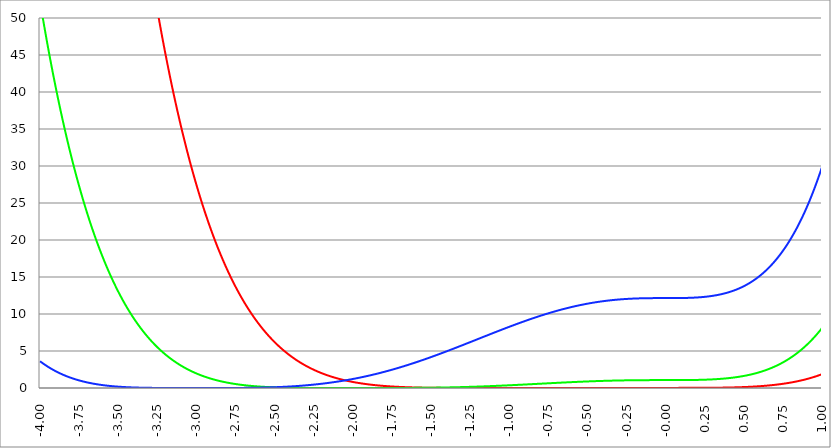
| Category | Series 1 | Series 0 | Series 2 |
|---|---|---|---|
| -4.0 | 238.95 | 52.267 | 3.617 |
| -3.9975 | 237.872 | 51.947 | 3.577 |
| -3.995 | 236.798 | 51.63 | 3.537 |
| -3.9925 | 235.728 | 51.314 | 3.498 |
| -3.99 | 234.662 | 50.999 | 3.459 |
| -3.9875 | 233.6 | 50.687 | 3.421 |
| -3.985 | 232.542 | 50.375 | 3.383 |
| -3.9825 | 231.489 | 50.066 | 3.345 |
| -3.98 | 230.439 | 49.757 | 3.308 |
| -3.9775 | 229.393 | 49.451 | 3.271 |
| -3.975000000000001 | 228.35 | 49.146 | 3.234 |
| -3.972500000000001 | 227.312 | 48.842 | 3.197 |
| -3.970000000000001 | 226.278 | 48.54 | 3.161 |
| -3.967500000000001 | 225.248 | 48.24 | 3.125 |
| -3.965000000000001 | 224.221 | 47.941 | 3.09 |
| -3.962500000000001 | 223.199 | 47.643 | 3.055 |
| -3.960000000000001 | 222.18 | 47.347 | 3.02 |
| -3.957500000000001 | 221.165 | 47.053 | 2.985 |
| -3.955000000000001 | 220.154 | 46.76 | 2.951 |
| -3.952500000000001 | 219.147 | 46.468 | 2.917 |
| -3.950000000000001 | 218.144 | 46.178 | 2.884 |
| -3.947500000000001 | 217.145 | 45.89 | 2.85 |
| -3.945000000000001 | 216.149 | 45.603 | 2.817 |
| -3.942500000000001 | 215.157 | 45.317 | 2.785 |
| -3.940000000000001 | 214.169 | 45.033 | 2.752 |
| -3.937500000000001 | 213.185 | 44.751 | 2.72 |
| -3.935000000000001 | 212.204 | 44.469 | 2.688 |
| -3.932500000000001 | 211.227 | 44.19 | 2.657 |
| -3.930000000000001 | 210.254 | 43.911 | 2.626 |
| -3.927500000000002 | 209.285 | 43.635 | 2.595 |
| -3.925000000000002 | 208.319 | 43.359 | 2.564 |
| -3.922500000000002 | 207.357 | 43.085 | 2.534 |
| -3.920000000000002 | 206.399 | 42.813 | 2.504 |
| -3.917500000000002 | 205.444 | 42.541 | 2.474 |
| -3.915000000000002 | 204.493 | 42.272 | 2.445 |
| -3.912500000000002 | 203.546 | 42.003 | 2.415 |
| -3.910000000000002 | 202.602 | 41.736 | 2.386 |
| -3.907500000000002 | 201.662 | 41.47 | 2.358 |
| -3.905000000000002 | 200.726 | 41.206 | 2.329 |
| -3.902500000000002 | 199.793 | 40.943 | 2.301 |
| -3.900000000000002 | 198.864 | 40.682 | 2.273 |
| -3.897500000000002 | 197.938 | 40.422 | 2.246 |
| -3.895000000000002 | 197.016 | 40.163 | 2.218 |
| -3.892500000000002 | 196.098 | 39.906 | 2.191 |
| -3.890000000000002 | 195.183 | 39.649 | 2.165 |
| -3.887500000000002 | 194.271 | 39.395 | 2.138 |
| -3.885000000000002 | 193.364 | 39.141 | 2.112 |
| -3.882500000000002 | 192.459 | 38.889 | 2.086 |
| -3.880000000000002 | 191.559 | 38.639 | 2.06 |
| -3.877500000000003 | 190.661 | 38.389 | 2.034 |
| -3.875000000000003 | 189.767 | 38.141 | 2.009 |
| -3.872500000000003 | 188.877 | 37.894 | 1.984 |
| -3.870000000000003 | 187.99 | 37.649 | 1.959 |
| -3.867500000000003 | 187.107 | 37.405 | 1.935 |
| -3.865000000000003 | 186.227 | 37.162 | 1.911 |
| -3.862500000000003 | 185.35 | 36.92 | 1.887 |
| -3.860000000000003 | 184.477 | 36.68 | 1.863 |
| -3.857500000000003 | 183.608 | 36.441 | 1.839 |
| -3.855000000000003 | 182.741 | 36.203 | 1.816 |
| -3.852500000000003 | 181.878 | 35.966 | 1.793 |
| -3.850000000000003 | 181.019 | 35.731 | 1.77 |
| -3.847500000000003 | 180.163 | 35.497 | 1.747 |
| -3.845000000000003 | 179.31 | 35.264 | 1.725 |
| -3.842500000000003 | 178.461 | 35.033 | 1.703 |
| -3.840000000000003 | 177.615 | 34.803 | 1.681 |
| -3.837500000000003 | 176.772 | 34.574 | 1.659 |
| -3.835000000000003 | 175.932 | 34.346 | 1.637 |
| -3.832500000000004 | 175.096 | 34.119 | 1.616 |
| -3.830000000000004 | 174.263 | 33.894 | 1.595 |
| -3.827500000000004 | 173.434 | 33.67 | 1.574 |
| -3.825000000000004 | 172.608 | 33.447 | 1.553 |
| -3.822500000000004 | 171.785 | 33.225 | 1.533 |
| -3.820000000000004 | 170.965 | 33.004 | 1.513 |
| -3.817500000000004 | 170.148 | 32.785 | 1.493 |
| -3.815000000000004 | 169.335 | 32.567 | 1.473 |
| -3.812500000000004 | 168.525 | 32.35 | 1.453 |
| -3.810000000000004 | 167.718 | 32.134 | 1.434 |
| -3.807500000000004 | 166.915 | 31.92 | 1.415 |
| -3.805000000000004 | 166.114 | 31.706 | 1.396 |
| -3.802500000000004 | 165.317 | 31.494 | 1.377 |
| -3.800000000000004 | 164.523 | 31.283 | 1.359 |
| -3.797500000000004 | 163.732 | 31.073 | 1.34 |
| -3.795000000000004 | 162.944 | 30.864 | 1.322 |
| -3.792500000000004 | 162.16 | 30.656 | 1.304 |
| -3.790000000000004 | 161.378 | 30.45 | 1.286 |
| -3.787500000000004 | 160.6 | 30.244 | 1.269 |
| -3.785000000000004 | 159.825 | 30.04 | 1.251 |
| -3.782500000000005 | 159.053 | 29.837 | 1.234 |
| -3.780000000000005 | 158.284 | 29.635 | 1.217 |
| -3.777500000000005 | 157.518 | 29.434 | 1.2 |
| -3.775000000000005 | 156.755 | 29.234 | 1.183 |
| -3.772500000000005 | 155.995 | 29.036 | 1.167 |
| -3.770000000000005 | 155.238 | 28.838 | 1.15 |
| -3.767500000000005 | 154.485 | 28.642 | 1.134 |
| -3.765000000000005 | 153.734 | 28.446 | 1.118 |
| -3.762500000000005 | 152.986 | 28.252 | 1.103 |
| -3.760000000000005 | 152.242 | 28.059 | 1.087 |
| -3.757500000000005 | 151.5 | 27.867 | 1.072 |
| -3.755000000000005 | 150.762 | 27.675 | 1.056 |
| -3.752500000000005 | 150.026 | 27.485 | 1.041 |
| -3.750000000000005 | 149.293 | 27.297 | 1.026 |
| -3.747500000000005 | 148.564 | 27.109 | 1.012 |
| -3.745000000000005 | 147.837 | 26.922 | 0.997 |
| -3.742500000000005 | 147.113 | 26.736 | 0.983 |
| -3.740000000000005 | 146.392 | 26.551 | 0.968 |
| -3.737500000000006 | 145.675 | 26.368 | 0.954 |
| -3.735000000000006 | 144.96 | 26.185 | 0.94 |
| -3.732500000000006 | 144.248 | 26.003 | 0.927 |
| -3.730000000000006 | 143.538 | 25.823 | 0.913 |
| -3.727500000000006 | 142.832 | 25.643 | 0.899 |
| -3.725000000000006 | 142.129 | 25.465 | 0.886 |
| -3.722500000000006 | 141.428 | 25.287 | 0.873 |
| -3.720000000000006 | 140.731 | 25.11 | 0.86 |
| -3.717500000000006 | 140.036 | 24.935 | 0.847 |
| -3.715000000000006 | 139.344 | 24.76 | 0.835 |
| -3.712500000000006 | 138.655 | 24.587 | 0.822 |
| -3.710000000000006 | 137.969 | 24.414 | 0.81 |
| -3.707500000000006 | 137.285 | 24.243 | 0.797 |
| -3.705000000000006 | 136.605 | 24.072 | 0.785 |
| -3.702500000000006 | 135.927 | 23.903 | 0.773 |
| -3.700000000000006 | 135.252 | 23.734 | 0.762 |
| -3.697500000000006 | 134.579 | 23.566 | 0.75 |
| -3.695000000000006 | 133.91 | 23.4 | 0.738 |
| -3.692500000000006 | 133.243 | 23.234 | 0.727 |
| -3.690000000000006 | 132.579 | 23.069 | 0.716 |
| -3.687500000000006 | 131.918 | 22.905 | 0.705 |
| -3.685000000000007 | 131.26 | 22.742 | 0.694 |
| -3.682500000000007 | 130.604 | 22.58 | 0.683 |
| -3.680000000000007 | 129.951 | 22.419 | 0.672 |
| -3.677500000000007 | 129.3 | 22.259 | 0.661 |
| -3.675000000000007 | 128.653 | 22.1 | 0.651 |
| -3.672500000000007 | 128.008 | 21.942 | 0.641 |
| -3.670000000000007 | 127.366 | 21.785 | 0.63 |
| -3.667500000000007 | 126.726 | 21.628 | 0.62 |
| -3.665000000000007 | 126.089 | 21.473 | 0.61 |
| -3.662500000000007 | 125.455 | 21.318 | 0.601 |
| -3.660000000000007 | 124.823 | 21.165 | 0.591 |
| -3.657500000000007 | 124.194 | 21.012 | 0.581 |
| -3.655000000000007 | 123.568 | 20.86 | 0.572 |
| -3.652500000000007 | 122.944 | 20.709 | 0.563 |
| -3.650000000000007 | 122.323 | 20.559 | 0.553 |
| -3.647500000000007 | 121.704 | 20.41 | 0.544 |
| -3.645000000000007 | 121.089 | 20.262 | 0.535 |
| -3.642500000000008 | 120.475 | 20.114 | 0.527 |
| -3.640000000000008 | 119.864 | 19.968 | 0.518 |
| -3.637500000000008 | 119.256 | 19.822 | 0.509 |
| -3.635000000000008 | 118.651 | 19.677 | 0.501 |
| -3.632500000000008 | 118.048 | 19.533 | 0.492 |
| -3.630000000000008 | 117.447 | 19.39 | 0.484 |
| -3.627500000000008 | 116.849 | 19.248 | 0.476 |
| -3.625000000000008 | 116.254 | 19.106 | 0.468 |
| -3.622500000000008 | 115.661 | 18.966 | 0.46 |
| -3.620000000000008 | 115.07 | 18.826 | 0.452 |
| -3.617500000000008 | 114.482 | 18.687 | 0.444 |
| -3.615000000000008 | 113.897 | 18.549 | 0.436 |
| -3.612500000000008 | 113.314 | 18.412 | 0.429 |
| -3.610000000000008 | 112.733 | 18.276 | 0.421 |
| -3.607500000000008 | 112.155 | 18.14 | 0.414 |
| -3.605000000000008 | 111.58 | 18.005 | 0.407 |
| -3.602500000000008 | 111.007 | 17.872 | 0.4 |
| -3.600000000000008 | 110.436 | 17.738 | 0.393 |
| -3.597500000000009 | 109.868 | 17.606 | 0.386 |
| -3.595000000000009 | 109.302 | 17.475 | 0.379 |
| -3.592500000000009 | 108.738 | 17.344 | 0.372 |
| -3.590000000000009 | 108.177 | 17.214 | 0.365 |
| -3.587500000000009 | 107.619 | 17.085 | 0.359 |
| -3.585000000000009 | 107.063 | 16.957 | 0.352 |
| -3.582500000000009 | 106.509 | 16.829 | 0.346 |
| -3.580000000000009 | 105.957 | 16.702 | 0.34 |
| -3.577500000000009 | 105.408 | 16.576 | 0.334 |
| -3.575000000000009 | 104.862 | 16.451 | 0.327 |
| -3.572500000000009 | 104.317 | 16.327 | 0.321 |
| -3.570000000000009 | 103.775 | 16.203 | 0.315 |
| -3.56750000000001 | 103.235 | 16.08 | 0.31 |
| -3.565000000000009 | 102.698 | 15.958 | 0.304 |
| -3.562500000000009 | 102.163 | 15.836 | 0.298 |
| -3.560000000000009 | 101.63 | 15.716 | 0.293 |
| -3.557500000000009 | 101.1 | 15.596 | 0.287 |
| -3.555000000000009 | 100.572 | 15.477 | 0.282 |
| -3.55250000000001 | 100.046 | 15.358 | 0.276 |
| -3.55000000000001 | 99.522 | 15.241 | 0.271 |
| -3.54750000000001 | 99.001 | 15.124 | 0.266 |
| -3.54500000000001 | 98.482 | 15.007 | 0.261 |
| -3.54250000000001 | 97.965 | 14.892 | 0.256 |
| -3.54000000000001 | 97.451 | 14.777 | 0.251 |
| -3.53750000000001 | 96.939 | 14.663 | 0.246 |
| -3.53500000000001 | 96.429 | 14.55 | 0.241 |
| -3.53250000000001 | 95.921 | 14.437 | 0.236 |
| -3.53000000000001 | 95.415 | 14.325 | 0.231 |
| -3.52750000000001 | 94.912 | 14.214 | 0.227 |
| -3.52500000000001 | 94.411 | 14.103 | 0.222 |
| -3.52250000000001 | 93.912 | 13.993 | 0.218 |
| -3.52000000000001 | 93.415 | 13.884 | 0.213 |
| -3.51750000000001 | 92.92 | 13.776 | 0.209 |
| -3.51500000000001 | 92.428 | 13.668 | 0.205 |
| -3.51250000000001 | 91.937 | 13.561 | 0.201 |
| -3.51000000000001 | 91.449 | 13.455 | 0.197 |
| -3.50750000000001 | 90.963 | 13.349 | 0.192 |
| -3.505000000000011 | 90.48 | 13.244 | 0.189 |
| -3.502500000000011 | 89.998 | 13.14 | 0.185 |
| -3.500000000000011 | 89.518 | 13.036 | 0.181 |
| -3.497500000000011 | 89.041 | 12.933 | 0.177 |
| -3.495000000000011 | 88.565 | 12.831 | 0.173 |
| -3.492500000000011 | 88.092 | 12.729 | 0.17 |
| -3.490000000000011 | 87.621 | 12.628 | 0.166 |
| -3.487500000000011 | 87.152 | 12.527 | 0.162 |
| -3.485000000000011 | 86.685 | 12.428 | 0.159 |
| -3.482500000000011 | 86.22 | 12.329 | 0.155 |
| -3.480000000000011 | 85.757 | 12.23 | 0.152 |
| -3.477500000000011 | 85.297 | 12.132 | 0.149 |
| -3.475000000000011 | 84.838 | 12.035 | 0.145 |
| -3.472500000000011 | 84.381 | 11.938 | 0.142 |
| -3.470000000000011 | 83.926 | 11.843 | 0.139 |
| -3.467500000000011 | 83.474 | 11.747 | 0.136 |
| -3.465000000000011 | 83.023 | 11.653 | 0.133 |
| -3.462500000000011 | 82.575 | 11.558 | 0.13 |
| -3.460000000000011 | 82.128 | 11.465 | 0.127 |
| -3.457500000000012 | 81.684 | 11.372 | 0.124 |
| -3.455000000000012 | 81.241 | 11.28 | 0.121 |
| -3.452500000000012 | 80.801 | 11.188 | 0.119 |
| -3.450000000000012 | 80.362 | 11.097 | 0.116 |
| -3.447500000000012 | 79.925 | 11.007 | 0.113 |
| -3.445000000000012 | 79.491 | 10.917 | 0.11 |
| -3.442500000000012 | 79.058 | 10.828 | 0.108 |
| -3.440000000000012 | 78.627 | 10.739 | 0.105 |
| -3.437500000000012 | 78.198 | 10.651 | 0.103 |
| -3.435000000000012 | 77.772 | 10.564 | 0.1 |
| -3.432500000000012 | 77.347 | 10.477 | 0.098 |
| -3.430000000000012 | 76.924 | 10.391 | 0.096 |
| -3.427500000000012 | 76.503 | 10.305 | 0.093 |
| -3.425000000000012 | 76.083 | 10.22 | 0.091 |
| -3.422500000000012 | 75.666 | 10.135 | 0.089 |
| -3.420000000000012 | 75.251 | 10.051 | 0.087 |
| -3.417500000000012 | 74.837 | 9.968 | 0.084 |
| -3.415000000000012 | 74.426 | 9.885 | 0.082 |
| -3.412500000000012 | 74.016 | 9.802 | 0.08 |
| -3.410000000000013 | 73.608 | 9.721 | 0.078 |
| -3.407500000000012 | 73.202 | 9.639 | 0.076 |
| -3.405000000000013 | 72.798 | 9.559 | 0.074 |
| -3.402500000000013 | 72.396 | 9.479 | 0.072 |
| -3.400000000000013 | 71.995 | 9.399 | 0.071 |
| -3.397500000000013 | 71.597 | 9.32 | 0.069 |
| -3.395000000000013 | 71.2 | 9.242 | 0.067 |
| -3.392500000000013 | 70.805 | 9.164 | 0.065 |
| -3.390000000000013 | 70.412 | 9.086 | 0.063 |
| -3.387500000000013 | 70.021 | 9.009 | 0.062 |
| -3.385000000000013 | 69.631 | 8.933 | 0.06 |
| -3.382500000000013 | 69.243 | 8.857 | 0.059 |
| -3.380000000000013 | 68.857 | 8.782 | 0.057 |
| -3.377500000000013 | 68.473 | 8.707 | 0.055 |
| -3.375000000000013 | 68.091 | 8.633 | 0.054 |
| -3.372500000000013 | 67.71 | 8.559 | 0.052 |
| -3.370000000000013 | 67.332 | 8.486 | 0.051 |
| -3.367500000000013 | 66.954 | 8.413 | 0.049 |
| -3.365000000000013 | 66.579 | 8.341 | 0.048 |
| -3.362500000000014 | 66.206 | 8.269 | 0.047 |
| -3.360000000000014 | 65.834 | 8.198 | 0.045 |
| -3.357500000000014 | 65.464 | 8.127 | 0.044 |
| -3.355000000000014 | 65.095 | 8.057 | 0.043 |
| -3.352500000000014 | 64.728 | 7.987 | 0.042 |
| -3.350000000000014 | 64.364 | 7.918 | 0.04 |
| -3.347500000000014 | 64 | 7.849 | 0.039 |
| -3.345000000000014 | 63.639 | 7.781 | 0.038 |
| -3.342500000000014 | 63.279 | 7.713 | 0.037 |
| -3.340000000000014 | 62.921 | 7.645 | 0.036 |
| -3.337500000000014 | 62.564 | 7.579 | 0.035 |
| -3.335000000000014 | 62.209 | 7.512 | 0.034 |
| -3.332500000000014 | 61.856 | 7.446 | 0.033 |
| -3.330000000000014 | 61.505 | 7.381 | 0.032 |
| -3.327500000000014 | 61.155 | 7.316 | 0.031 |
| -3.325000000000014 | 60.807 | 7.251 | 0.03 |
| -3.322500000000014 | 60.46 | 7.187 | 0.029 |
| -3.320000000000014 | 60.115 | 7.124 | 0.028 |
| -3.317500000000015 | 59.772 | 7.06 | 0.027 |
| -3.315000000000015 | 59.43 | 6.998 | 0.026 |
| -3.312500000000015 | 59.09 | 6.935 | 0.025 |
| -3.310000000000015 | 58.752 | 6.874 | 0.024 |
| -3.307500000000015 | 58.415 | 6.812 | 0.024 |
| -3.305000000000015 | 58.08 | 6.751 | 0.023 |
| -3.302500000000015 | 57.746 | 6.691 | 0.022 |
| -3.300000000000015 | 57.414 | 6.631 | 0.021 |
| -3.297500000000015 | 57.084 | 6.571 | 0.021 |
| -3.295000000000015 | 56.755 | 6.512 | 0.02 |
| -3.292500000000015 | 56.427 | 6.453 | 0.019 |
| -3.290000000000015 | 56.102 | 6.395 | 0.018 |
| -3.287500000000015 | 55.777 | 6.337 | 0.018 |
| -3.285000000000015 | 55.455 | 6.28 | 0.017 |
| -3.282500000000015 | 55.134 | 6.223 | 0.017 |
| -3.280000000000015 | 54.814 | 6.166 | 0.016 |
| -3.277500000000015 | 54.496 | 6.11 | 0.015 |
| -3.275000000000015 | 54.18 | 6.054 | 0.015 |
| -3.272500000000015 | 53.865 | 5.999 | 0.014 |
| -3.270000000000016 | 53.551 | 5.944 | 0.014 |
| -3.267500000000015 | 53.239 | 5.889 | 0.013 |
| -3.265000000000016 | 52.929 | 5.835 | 0.013 |
| -3.262500000000016 | 52.62 | 5.781 | 0.012 |
| -3.260000000000016 | 52.313 | 5.728 | 0.012 |
| -3.257500000000016 | 52.007 | 5.675 | 0.011 |
| -3.255000000000016 | 51.702 | 5.623 | 0.011 |
| -3.252500000000016 | 51.399 | 5.57 | 0.01 |
| -3.250000000000016 | 51.098 | 5.519 | 0.01 |
| -3.247500000000016 | 50.798 | 5.467 | 0.01 |
| -3.245000000000016 | 50.499 | 5.416 | 0.009 |
| -3.242500000000016 | 50.202 | 5.366 | 0.009 |
| -3.240000000000016 | 49.906 | 5.315 | 0.008 |
| -3.237500000000016 | 49.612 | 5.266 | 0.008 |
| -3.235000000000016 | 49.319 | 5.216 | 0.008 |
| -3.232500000000016 | 49.028 | 5.167 | 0.007 |
| -3.230000000000016 | 48.738 | 5.118 | 0.007 |
| -3.227500000000016 | 48.449 | 5.07 | 0.007 |
| -3.225000000000016 | 48.162 | 5.022 | 0.006 |
| -3.222500000000016 | 47.876 | 4.974 | 0.006 |
| -3.220000000000016 | 47.592 | 4.927 | 0.006 |
| -3.217500000000016 | 47.309 | 4.88 | 0.006 |
| -3.215000000000017 | 47.028 | 4.834 | 0.005 |
| -3.212500000000017 | 46.748 | 4.787 | 0.005 |
| -3.210000000000017 | 46.469 | 4.742 | 0.005 |
| -3.207500000000016 | 46.191 | 4.696 | 0.005 |
| -3.205000000000017 | 45.915 | 4.651 | 0.004 |
| -3.202500000000017 | 45.641 | 4.606 | 0.004 |
| -3.200000000000017 | 45.368 | 4.562 | 0.004 |
| -3.197500000000017 | 45.096 | 4.518 | 0.004 |
| -3.195000000000017 | 44.825 | 4.474 | 0.004 |
| -3.192500000000017 | 44.556 | 4.431 | 0.003 |
| -3.190000000000017 | 44.288 | 4.388 | 0.003 |
| -3.187500000000017 | 44.021 | 4.345 | 0.003 |
| -3.185000000000017 | 43.756 | 4.303 | 0.003 |
| -3.182500000000017 | 43.492 | 4.261 | 0.003 |
| -3.180000000000017 | 43.23 | 4.219 | 0.003 |
| -3.177500000000017 | 42.969 | 4.178 | 0.002 |
| -3.175000000000018 | 42.709 | 4.136 | 0.002 |
| -3.172500000000018 | 42.45 | 4.096 | 0.002 |
| -3.170000000000018 | 42.193 | 4.055 | 0.002 |
| -3.167500000000017 | 41.936 | 4.015 | 0.002 |
| -3.165000000000018 | 41.682 | 3.976 | 0.002 |
| -3.162500000000018 | 41.428 | 3.936 | 0.002 |
| -3.160000000000018 | 41.176 | 3.897 | 0.002 |
| -3.157500000000018 | 40.925 | 3.858 | 0.002 |
| -3.155000000000018 | 40.675 | 3.82 | 0.001 |
| -3.152500000000018 | 40.427 | 3.781 | 0.001 |
| -3.150000000000018 | 40.18 | 3.744 | 0.001 |
| -3.147500000000018 | 39.934 | 3.706 | 0.001 |
| -3.145000000000018 | 39.689 | 3.669 | 0.001 |
| -3.142500000000018 | 39.446 | 3.632 | 0.001 |
| -3.140000000000018 | 39.204 | 3.595 | 0.001 |
| -3.137500000000018 | 38.963 | 3.559 | 0.001 |
| -3.135000000000018 | 38.723 | 3.523 | 0.001 |
| -3.132500000000018 | 38.484 | 3.487 | 0.001 |
| -3.130000000000019 | 38.247 | 3.451 | 0.001 |
| -3.127500000000018 | 38.011 | 3.416 | 0.001 |
| -3.125000000000019 | 37.776 | 3.381 | 0.001 |
| -3.122500000000019 | 37.543 | 3.347 | 0.001 |
| -3.120000000000019 | 37.31 | 3.312 | 0 |
| -3.117500000000019 | 37.079 | 3.278 | 0 |
| -3.115000000000019 | 36.849 | 3.245 | 0 |
| -3.112500000000019 | 36.62 | 3.211 | 0 |
| -3.110000000000019 | 36.392 | 3.178 | 0 |
| -3.10750000000002 | 36.165 | 3.145 | 0 |
| -3.10500000000002 | 35.94 | 3.112 | 0 |
| -3.10250000000002 | 35.716 | 3.08 | 0 |
| -3.10000000000002 | 35.493 | 3.048 | 0 |
| -3.09750000000002 | 35.271 | 3.016 | 0 |
| -3.095000000000019 | 35.05 | 2.984 | 0 |
| -3.092500000000019 | 34.83 | 2.953 | 0 |
| -3.090000000000019 | 34.612 | 2.922 | 0 |
| -3.08750000000002 | 34.395 | 2.891 | 0 |
| -3.085000000000019 | 34.178 | 2.861 | 0 |
| -3.08250000000002 | 33.963 | 2.83 | 0 |
| -3.08000000000002 | 33.749 | 2.8 | 0 |
| -3.07750000000002 | 33.536 | 2.771 | 0 |
| -3.07500000000002 | 33.325 | 2.741 | 0 |
| -3.07250000000002 | 33.114 | 2.712 | 0 |
| -3.07000000000002 | 32.905 | 2.683 | 0 |
| -3.06750000000002 | 32.696 | 2.654 | 0 |
| -3.06500000000002 | 32.489 | 2.626 | 0 |
| -3.06250000000002 | 32.282 | 2.597 | 0 |
| -3.06000000000002 | 32.077 | 2.569 | 0 |
| -3.05750000000002 | 31.873 | 2.542 | 0 |
| -3.05500000000002 | 31.67 | 2.514 | 0 |
| -3.05250000000002 | 31.468 | 2.487 | 0 |
| -3.05000000000002 | 31.267 | 2.46 | 0 |
| -3.04750000000002 | 31.068 | 2.433 | 0 |
| -3.04500000000002 | 30.869 | 2.407 | 0 |
| -3.04250000000002 | 30.671 | 2.38 | 0 |
| -3.04000000000002 | 30.474 | 2.354 | 0 |
| -3.037500000000021 | 30.279 | 2.328 | 0 |
| -3.035000000000021 | 30.084 | 2.303 | 0 |
| -3.032500000000021 | 29.891 | 2.277 | 0 |
| -3.030000000000021 | 29.698 | 2.252 | 0 |
| -3.027500000000021 | 29.507 | 2.227 | 0 |
| -3.025000000000021 | 29.316 | 2.202 | 0 |
| -3.022500000000021 | 29.127 | 2.178 | 0 |
| -3.020000000000021 | 28.938 | 2.153 | 0 |
| -3.017500000000021 | 28.751 | 2.129 | 0 |
| -3.015000000000021 | 28.564 | 2.105 | 0 |
| -3.012500000000021 | 28.379 | 2.082 | 0 |
| -3.010000000000021 | 28.195 | 2.058 | 0 |
| -3.007500000000021 | 28.011 | 2.035 | 0 |
| -3.005000000000021 | 27.829 | 2.012 | 0 |
| -3.002500000000021 | 27.647 | 1.989 | 0 |
| -3.000000000000021 | 27.467 | 1.967 | 0 |
| -2.997500000000021 | 27.287 | 1.944 | 0 |
| -2.995000000000021 | 27.109 | 1.922 | 0 |
| -2.992500000000021 | 26.931 | 1.9 | 0 |
| -2.990000000000021 | 26.754 | 1.878 | 0 |
| -2.987500000000022 | 26.579 | 1.857 | 0 |
| -2.985000000000022 | 26.404 | 1.835 | 0 |
| -2.982500000000022 | 26.23 | 1.814 | 0 |
| -2.980000000000022 | 26.058 | 1.793 | 0 |
| -2.977500000000022 | 25.886 | 1.772 | 0 |
| -2.975000000000022 | 25.715 | 1.752 | 0 |
| -2.972500000000022 | 25.545 | 1.731 | 0 |
| -2.970000000000022 | 25.376 | 1.711 | 0 |
| -2.967500000000022 | 25.208 | 1.691 | 0 |
| -2.965000000000022 | 25.04 | 1.671 | 0 |
| -2.962500000000022 | 24.874 | 1.652 | 0 |
| -2.960000000000022 | 24.709 | 1.632 | 0 |
| -2.957500000000022 | 24.544 | 1.613 | 0 |
| -2.955000000000022 | 24.381 | 1.594 | 0 |
| -2.952500000000022 | 24.218 | 1.575 | 0 |
| -2.950000000000022 | 24.056 | 1.556 | 0 |
| -2.947500000000022 | 23.895 | 1.537 | 0 |
| -2.945000000000022 | 23.735 | 1.519 | 0 |
| -2.942500000000023 | 23.576 | 1.501 | 0 |
| -2.940000000000023 | 23.418 | 1.483 | 0 |
| -2.937500000000023 | 23.261 | 1.465 | 0 |
| -2.935000000000023 | 23.104 | 1.447 | 0 |
| -2.932500000000023 | 22.949 | 1.43 | 0 |
| -2.930000000000023 | 22.794 | 1.412 | 0 |
| -2.927500000000023 | 22.64 | 1.395 | 0 |
| -2.925000000000023 | 22.487 | 1.378 | 0 |
| -2.922500000000023 | 22.335 | 1.361 | 0 |
| -2.920000000000023 | 22.184 | 1.345 | 0 |
| -2.917500000000023 | 22.033 | 1.328 | 0 |
| -2.915000000000023 | 21.884 | 1.312 | 0 |
| -2.912500000000023 | 21.735 | 1.296 | 0 |
| -2.910000000000023 | 21.587 | 1.28 | 0 |
| -2.907500000000023 | 21.44 | 1.264 | 0 |
| -2.905000000000023 | 21.293 | 1.248 | 0 |
| -2.902500000000023 | 21.148 | 1.232 | 0 |
| -2.900000000000023 | 21.003 | 1.217 | 0 |
| -2.897500000000023 | 20.86 | 1.202 | 0 |
| -2.895000000000023 | 20.717 | 1.187 | 0 |
| -2.892500000000024 | 20.574 | 1.172 | 0 |
| -2.890000000000024 | 20.433 | 1.157 | 0 |
| -2.887500000000024 | 20.292 | 1.142 | 0 |
| -2.885000000000024 | 20.153 | 1.128 | 0 |
| -2.882500000000024 | 20.014 | 1.113 | 0 |
| -2.880000000000024 | 19.876 | 1.099 | 0 |
| -2.877500000000024 | 19.738 | 1.085 | 0 |
| -2.875000000000024 | 19.602 | 1.071 | 0.001 |
| -2.872500000000024 | 19.466 | 1.058 | 0.001 |
| -2.870000000000024 | 19.331 | 1.044 | 0.001 |
| -2.867500000000024 | 19.196 | 1.03 | 0.001 |
| -2.865000000000024 | 19.063 | 1.017 | 0.001 |
| -2.862500000000024 | 18.93 | 1.004 | 0.001 |
| -2.860000000000024 | 18.798 | 0.991 | 0.001 |
| -2.857500000000024 | 18.667 | 0.978 | 0.001 |
| -2.855000000000024 | 18.537 | 0.965 | 0.001 |
| -2.852500000000024 | 18.407 | 0.952 | 0.001 |
| -2.850000000000024 | 18.278 | 0.94 | 0.001 |
| -2.847500000000025 | 18.15 | 0.927 | 0.001 |
| -2.845000000000025 | 18.022 | 0.915 | 0.001 |
| -2.842500000000025 | 17.896 | 0.903 | 0.001 |
| -2.840000000000025 | 17.77 | 0.891 | 0.001 |
| -2.837500000000025 | 17.644 | 0.879 | 0.001 |
| -2.835000000000025 | 17.52 | 0.867 | 0.002 |
| -2.832500000000025 | 17.396 | 0.856 | 0.002 |
| -2.830000000000025 | 17.273 | 0.844 | 0.002 |
| -2.827500000000025 | 17.151 | 0.833 | 0.002 |
| -2.825000000000025 | 17.029 | 0.822 | 0.002 |
| -2.822500000000025 | 16.908 | 0.81 | 0.002 |
| -2.820000000000025 | 16.788 | 0.799 | 0.002 |
| -2.817500000000025 | 16.668 | 0.788 | 0.002 |
| -2.815000000000025 | 16.55 | 0.778 | 0.002 |
| -2.812500000000025 | 16.431 | 0.767 | 0.003 |
| -2.810000000000025 | 16.314 | 0.756 | 0.003 |
| -2.807500000000025 | 16.197 | 0.746 | 0.003 |
| -2.805000000000025 | 16.081 | 0.736 | 0.003 |
| -2.802500000000025 | 15.966 | 0.726 | 0.003 |
| -2.800000000000026 | 15.851 | 0.715 | 0.003 |
| -2.797500000000026 | 15.737 | 0.705 | 0.003 |
| -2.795000000000026 | 15.624 | 0.696 | 0.004 |
| -2.792500000000026 | 15.512 | 0.686 | 0.004 |
| -2.790000000000026 | 15.4 | 0.676 | 0.004 |
| -2.787500000000026 | 15.288 | 0.667 | 0.004 |
| -2.785000000000026 | 15.178 | 0.657 | 0.004 |
| -2.782500000000026 | 15.068 | 0.648 | 0.004 |
| -2.780000000000026 | 14.958 | 0.639 | 0.005 |
| -2.777500000000026 | 14.85 | 0.63 | 0.005 |
| -2.775000000000026 | 14.742 | 0.621 | 0.005 |
| -2.772500000000026 | 14.634 | 0.612 | 0.005 |
| -2.770000000000026 | 14.528 | 0.603 | 0.006 |
| -2.767500000000026 | 14.422 | 0.594 | 0.006 |
| -2.765000000000026 | 14.316 | 0.585 | 0.006 |
| -2.762500000000026 | 14.212 | 0.577 | 0.006 |
| -2.760000000000026 | 14.107 | 0.569 | 0.007 |
| -2.757500000000026 | 14.004 | 0.56 | 0.007 |
| -2.755000000000026 | 13.901 | 0.552 | 0.007 |
| -2.752500000000027 | 13.799 | 0.544 | 0.007 |
| -2.750000000000027 | 13.697 | 0.536 | 0.008 |
| -2.747500000000026 | 13.596 | 0.528 | 0.008 |
| -2.745000000000027 | 13.496 | 0.52 | 0.008 |
| -2.742500000000027 | 13.396 | 0.512 | 0.009 |
| -2.740000000000027 | 13.297 | 0.505 | 0.009 |
| -2.737500000000027 | 13.198 | 0.497 | 0.009 |
| -2.735000000000027 | 13.1 | 0.49 | 0.01 |
| -2.732500000000027 | 13.003 | 0.482 | 0.01 |
| -2.730000000000027 | 12.906 | 0.475 | 0.01 |
| -2.727500000000027 | 12.81 | 0.468 | 0.011 |
| -2.725000000000027 | 12.714 | 0.461 | 0.011 |
| -2.722500000000027 | 12.619 | 0.454 | 0.011 |
| -2.720000000000027 | 12.525 | 0.447 | 0.012 |
| -2.717500000000027 | 12.431 | 0.44 | 0.012 |
| -2.715000000000027 | 12.338 | 0.433 | 0.013 |
| -2.712500000000027 | 12.245 | 0.426 | 0.013 |
| -2.710000000000027 | 12.153 | 0.42 | 0.014 |
| -2.707500000000027 | 12.062 | 0.413 | 0.014 |
| -2.705000000000028 | 11.971 | 0.407 | 0.014 |
| -2.702500000000028 | 11.88 | 0.4 | 0.015 |
| -2.700000000000028 | 11.79 | 0.394 | 0.015 |
| -2.697500000000028 | 11.701 | 0.388 | 0.016 |
| -2.695000000000028 | 11.612 | 0.382 | 0.016 |
| -2.692500000000028 | 11.524 | 0.376 | 0.017 |
| -2.690000000000028 | 11.437 | 0.37 | 0.017 |
| -2.687500000000028 | 11.35 | 0.364 | 0.018 |
| -2.685000000000028 | 11.263 | 0.358 | 0.019 |
| -2.682500000000028 | 11.177 | 0.352 | 0.019 |
| -2.680000000000028 | 11.092 | 0.347 | 0.02 |
| -2.677500000000028 | 11.007 | 0.341 | 0.02 |
| -2.675000000000028 | 10.923 | 0.335 | 0.021 |
| -2.672500000000028 | 10.839 | 0.33 | 0.022 |
| -2.670000000000028 | 10.755 | 0.325 | 0.022 |
| -2.667500000000028 | 10.673 | 0.319 | 0.023 |
| -2.665000000000028 | 10.591 | 0.314 | 0.024 |
| -2.662500000000028 | 10.509 | 0.309 | 0.024 |
| -2.660000000000028 | 10.428 | 0.304 | 0.025 |
| -2.657500000000029 | 10.347 | 0.299 | 0.026 |
| -2.655000000000029 | 10.267 | 0.294 | 0.026 |
| -2.652500000000029 | 10.187 | 0.289 | 0.027 |
| -2.650000000000029 | 10.108 | 0.284 | 0.028 |
| -2.647500000000029 | 10.03 | 0.279 | 0.029 |
| -2.645000000000029 | 9.951 | 0.274 | 0.029 |
| -2.642500000000029 | 9.874 | 0.27 | 0.03 |
| -2.640000000000029 | 9.797 | 0.265 | 0.031 |
| -2.637500000000029 | 9.72 | 0.261 | 0.032 |
| -2.635000000000029 | 9.644 | 0.256 | 0.033 |
| -2.632500000000029 | 9.568 | 0.252 | 0.033 |
| -2.630000000000029 | 9.493 | 0.247 | 0.034 |
| -2.62750000000003 | 9.419 | 0.243 | 0.035 |
| -2.625000000000029 | 9.344 | 0.239 | 0.036 |
| -2.622500000000029 | 9.271 | 0.235 | 0.037 |
| -2.620000000000029 | 9.198 | 0.231 | 0.038 |
| -2.617500000000029 | 9.125 | 0.226 | 0.039 |
| -2.615000000000029 | 9.053 | 0.222 | 0.04 |
| -2.612500000000029 | 8.981 | 0.219 | 0.041 |
| -2.61000000000003 | 8.909 | 0.215 | 0.042 |
| -2.60750000000003 | 8.839 | 0.211 | 0.043 |
| -2.60500000000003 | 8.768 | 0.207 | 0.044 |
| -2.60250000000003 | 8.698 | 0.203 | 0.045 |
| -2.60000000000003 | 8.629 | 0.2 | 0.046 |
| -2.59750000000003 | 8.56 | 0.196 | 0.047 |
| -2.59500000000003 | 8.491 | 0.192 | 0.048 |
| -2.59250000000003 | 8.423 | 0.189 | 0.049 |
| -2.59000000000003 | 8.356 | 0.185 | 0.05 |
| -2.58750000000003 | 8.288 | 0.182 | 0.052 |
| -2.58500000000003 | 8.222 | 0.179 | 0.053 |
| -2.58250000000003 | 8.155 | 0.175 | 0.054 |
| -2.58000000000003 | 8.09 | 0.172 | 0.055 |
| -2.57750000000003 | 8.024 | 0.169 | 0.056 |
| -2.57500000000003 | 7.959 | 0.166 | 0.058 |
| -2.57250000000003 | 7.895 | 0.162 | 0.059 |
| -2.57000000000003 | 7.831 | 0.159 | 0.06 |
| -2.56750000000003 | 7.767 | 0.156 | 0.062 |
| -2.565000000000031 | 7.704 | 0.153 | 0.063 |
| -2.562500000000031 | 7.641 | 0.15 | 0.064 |
| -2.560000000000031 | 7.578 | 0.148 | 0.066 |
| -2.557500000000031 | 7.516 | 0.145 | 0.067 |
| -2.555000000000031 | 7.455 | 0.142 | 0.069 |
| -2.552500000000031 | 7.394 | 0.139 | 0.07 |
| -2.550000000000031 | 7.333 | 0.136 | 0.072 |
| -2.547500000000031 | 7.273 | 0.134 | 0.073 |
| -2.545000000000031 | 7.213 | 0.131 | 0.075 |
| -2.542500000000031 | 7.153 | 0.128 | 0.076 |
| -2.540000000000031 | 7.094 | 0.126 | 0.078 |
| -2.537500000000031 | 7.035 | 0.123 | 0.079 |
| -2.535000000000031 | 6.977 | 0.121 | 0.081 |
| -2.532500000000031 | 6.919 | 0.118 | 0.082 |
| -2.530000000000031 | 6.862 | 0.116 | 0.084 |
| -2.527500000000031 | 6.804 | 0.114 | 0.086 |
| -2.525000000000031 | 6.748 | 0.111 | 0.087 |
| -2.522500000000031 | 6.691 | 0.109 | 0.089 |
| -2.520000000000032 | 6.635 | 0.107 | 0.091 |
| -2.517500000000032 | 6.58 | 0.105 | 0.093 |
| -2.515000000000032 | 6.525 | 0.102 | 0.094 |
| -2.512500000000032 | 6.47 | 0.1 | 0.096 |
| -2.510000000000032 | 6.415 | 0.098 | 0.098 |
| -2.507500000000032 | 6.361 | 0.096 | 0.1 |
| -2.505000000000032 | 6.308 | 0.094 | 0.102 |
| -2.502500000000032 | 6.254 | 0.092 | 0.104 |
| -2.500000000000032 | 6.202 | 0.09 | 0.106 |
| -2.497500000000032 | 6.149 | 0.088 | 0.108 |
| -2.495000000000032 | 6.097 | 0.086 | 0.11 |
| -2.492500000000032 | 6.045 | 0.084 | 0.112 |
| -2.490000000000032 | 5.994 | 0.083 | 0.114 |
| -2.487500000000032 | 5.942 | 0.081 | 0.116 |
| -2.485000000000032 | 5.892 | 0.079 | 0.118 |
| -2.482500000000032 | 5.841 | 0.077 | 0.12 |
| -2.480000000000032 | 5.791 | 0.076 | 0.122 |
| -2.477500000000032 | 5.742 | 0.074 | 0.124 |
| -2.475000000000032 | 5.692 | 0.072 | 0.127 |
| -2.472500000000033 | 5.643 | 0.071 | 0.129 |
| -2.470000000000033 | 5.595 | 0.069 | 0.131 |
| -2.467500000000032 | 5.546 | 0.067 | 0.133 |
| -2.465000000000033 | 5.499 | 0.066 | 0.136 |
| -2.462500000000033 | 5.451 | 0.064 | 0.138 |
| -2.460000000000033 | 5.404 | 0.063 | 0.14 |
| -2.457500000000033 | 5.357 | 0.061 | 0.143 |
| -2.455000000000033 | 5.31 | 0.06 | 0.145 |
| -2.452500000000033 | 5.264 | 0.059 | 0.148 |
| -2.450000000000033 | 5.218 | 0.057 | 0.15 |
| -2.447500000000033 | 5.172 | 0.056 | 0.153 |
| -2.445000000000033 | 5.127 | 0.054 | 0.155 |
| -2.442500000000033 | 5.082 | 0.053 | 0.158 |
| -2.440000000000033 | 5.038 | 0.052 | 0.16 |
| -2.437500000000033 | 4.993 | 0.051 | 0.163 |
| -2.435000000000033 | 4.949 | 0.049 | 0.166 |
| -2.432500000000033 | 4.906 | 0.048 | 0.168 |
| -2.430000000000033 | 4.862 | 0.047 | 0.171 |
| -2.427500000000033 | 4.819 | 0.046 | 0.174 |
| -2.425000000000034 | 4.777 | 0.045 | 0.177 |
| -2.422500000000034 | 4.734 | 0.044 | 0.179 |
| -2.420000000000034 | 4.692 | 0.042 | 0.182 |
| -2.417500000000034 | 4.651 | 0.041 | 0.185 |
| -2.415000000000034 | 4.609 | 0.04 | 0.188 |
| -2.412500000000034 | 4.568 | 0.039 | 0.191 |
| -2.410000000000034 | 4.527 | 0.038 | 0.194 |
| -2.407500000000034 | 4.486 | 0.037 | 0.197 |
| -2.405000000000034 | 4.446 | 0.036 | 0.2 |
| -2.402500000000034 | 4.406 | 0.035 | 0.203 |
| -2.400000000000034 | 4.367 | 0.034 | 0.206 |
| -2.397500000000034 | 4.327 | 0.034 | 0.209 |
| -2.395000000000034 | 4.288 | 0.033 | 0.212 |
| -2.392500000000034 | 4.249 | 0.032 | 0.216 |
| -2.390000000000034 | 4.211 | 0.031 | 0.219 |
| -2.387500000000034 | 4.173 | 0.03 | 0.222 |
| -2.385000000000034 | 4.135 | 0.029 | 0.225 |
| -2.382500000000034 | 4.097 | 0.028 | 0.229 |
| -2.380000000000034 | 4.06 | 0.028 | 0.232 |
| -2.377500000000035 | 4.023 | 0.027 | 0.235 |
| -2.375000000000035 | 3.986 | 0.026 | 0.239 |
| -2.372500000000035 | 3.949 | 0.025 | 0.242 |
| -2.370000000000035 | 3.913 | 0.025 | 0.246 |
| -2.367500000000035 | 3.877 | 0.024 | 0.249 |
| -2.365000000000035 | 3.841 | 0.023 | 0.253 |
| -2.362500000000035 | 3.806 | 0.023 | 0.256 |
| -2.360000000000035 | 3.771 | 0.022 | 0.26 |
| -2.357500000000035 | 3.736 | 0.021 | 0.264 |
| -2.355000000000035 | 3.701 | 0.021 | 0.267 |
| -2.352500000000035 | 3.667 | 0.02 | 0.271 |
| -2.350000000000035 | 3.633 | 0.02 | 0.275 |
| -2.347500000000035 | 3.599 | 0.019 | 0.279 |
| -2.345000000000035 | 3.565 | 0.018 | 0.283 |
| -2.342500000000035 | 3.532 | 0.018 | 0.287 |
| -2.340000000000035 | 3.499 | 0.017 | 0.29 |
| -2.337500000000035 | 3.466 | 0.017 | 0.294 |
| -2.335000000000035 | 3.434 | 0.016 | 0.298 |
| -2.332500000000035 | 3.401 | 0.016 | 0.302 |
| -2.330000000000036 | 3.369 | 0.015 | 0.306 |
| -2.327500000000036 | 3.338 | 0.015 | 0.311 |
| -2.325000000000036 | 3.306 | 0.014 | 0.315 |
| -2.322500000000036 | 3.275 | 0.014 | 0.319 |
| -2.320000000000036 | 3.244 | 0.013 | 0.323 |
| -2.317500000000036 | 3.213 | 0.013 | 0.327 |
| -2.315000000000036 | 3.182 | 0.012 | 0.332 |
| -2.312500000000036 | 3.152 | 0.012 | 0.336 |
| -2.310000000000036 | 3.122 | 0.012 | 0.34 |
| -2.307500000000036 | 3.092 | 0.011 | 0.345 |
| -2.305000000000036 | 3.062 | 0.011 | 0.349 |
| -2.302500000000036 | 3.033 | 0.011 | 0.354 |
| -2.300000000000036 | 3.004 | 0.01 | 0.358 |
| -2.297500000000036 | 2.975 | 0.01 | 0.363 |
| -2.295000000000036 | 2.946 | 0.009 | 0.367 |
| -2.292500000000036 | 2.918 | 0.009 | 0.372 |
| -2.290000000000036 | 2.889 | 0.009 | 0.377 |
| -2.287500000000036 | 2.861 | 0.008 | 0.381 |
| -2.285000000000036 | 2.833 | 0.008 | 0.386 |
| -2.282500000000036 | 2.806 | 0.008 | 0.391 |
| -2.280000000000036 | 2.778 | 0.008 | 0.396 |
| -2.277500000000036 | 2.751 | 0.007 | 0.401 |
| -2.275000000000037 | 2.724 | 0.007 | 0.405 |
| -2.272500000000037 | 2.698 | 0.007 | 0.41 |
| -2.270000000000037 | 2.671 | 0.007 | 0.415 |
| -2.267500000000036 | 2.645 | 0.006 | 0.42 |
| -2.265000000000037 | 2.619 | 0.006 | 0.426 |
| -2.262500000000037 | 2.593 | 0.006 | 0.431 |
| -2.260000000000037 | 2.567 | 0.006 | 0.436 |
| -2.257500000000037 | 2.542 | 0.005 | 0.441 |
| -2.255000000000037 | 2.517 | 0.005 | 0.446 |
| -2.252500000000037 | 2.492 | 0.005 | 0.451 |
| -2.250000000000037 | 2.467 | 0.005 | 0.457 |
| -2.247500000000037 | 2.442 | 0.005 | 0.462 |
| -2.245000000000037 | 2.418 | 0.004 | 0.468 |
| -2.242500000000037 | 2.394 | 0.004 | 0.473 |
| -2.240000000000037 | 2.37 | 0.004 | 0.479 |
| -2.237500000000037 | 2.346 | 0.004 | 0.484 |
| -2.235000000000038 | 2.322 | 0.004 | 0.49 |
| -2.232500000000038 | 2.299 | 0.003 | 0.495 |
| -2.230000000000038 | 2.275 | 0.003 | 0.501 |
| -2.227500000000037 | 2.252 | 0.003 | 0.507 |
| -2.225000000000038 | 2.23 | 0.003 | 0.512 |
| -2.222500000000038 | 2.207 | 0.003 | 0.518 |
| -2.220000000000038 | 2.184 | 0.003 | 0.524 |
| -2.217500000000038 | 2.162 | 0.003 | 0.53 |
| -2.215000000000038 | 2.14 | 0.003 | 0.536 |
| -2.212500000000038 | 2.118 | 0.002 | 0.542 |
| -2.210000000000038 | 2.096 | 0.002 | 0.548 |
| -2.207500000000038 | 2.075 | 0.002 | 0.554 |
| -2.205000000000038 | 2.054 | 0.002 | 0.56 |
| -2.202500000000038 | 2.032 | 0.002 | 0.566 |
| -2.200000000000038 | 2.011 | 0.002 | 0.572 |
| -2.197500000000038 | 1.991 | 0.002 | 0.578 |
| -2.195000000000038 | 1.97 | 0.002 | 0.585 |
| -2.192500000000038 | 1.949 | 0.002 | 0.591 |
| -2.190000000000039 | 1.929 | 0.002 | 0.597 |
| -2.187500000000038 | 1.909 | 0.001 | 0.604 |
| -2.185000000000039 | 1.889 | 0.001 | 0.61 |
| -2.182500000000039 | 1.869 | 0.001 | 0.617 |
| -2.180000000000039 | 1.85 | 0.001 | 0.623 |
| -2.177500000000039 | 1.83 | 0.001 | 0.63 |
| -2.175000000000039 | 1.811 | 0.001 | 0.636 |
| -2.172500000000039 | 1.792 | 0.001 | 0.643 |
| -2.170000000000039 | 1.773 | 0.001 | 0.65 |
| -2.16750000000004 | 1.754 | 0.001 | 0.656 |
| -2.16500000000004 | 1.736 | 0.001 | 0.663 |
| -2.16250000000004 | 1.717 | 0.001 | 0.67 |
| -2.16000000000004 | 1.699 | 0.001 | 0.677 |
| -2.15750000000004 | 1.681 | 0.001 | 0.684 |
| -2.155000000000039 | 1.663 | 0.001 | 0.691 |
| -2.152500000000039 | 1.645 | 0.001 | 0.698 |
| -2.150000000000039 | 1.627 | 0.001 | 0.705 |
| -2.14750000000004 | 1.61 | 0.001 | 0.712 |
| -2.14500000000004 | 1.592 | 0 | 0.719 |
| -2.14250000000004 | 1.575 | 0 | 0.726 |
| -2.14000000000004 | 1.558 | 0 | 0.734 |
| -2.13750000000004 | 1.541 | 0 | 0.741 |
| -2.13500000000004 | 1.525 | 0 | 0.748 |
| -2.13250000000004 | 1.508 | 0 | 0.756 |
| -2.13000000000004 | 1.492 | 0 | 0.763 |
| -2.12750000000004 | 1.475 | 0 | 0.771 |
| -2.12500000000004 | 1.459 | 0 | 0.778 |
| -2.12250000000004 | 1.443 | 0 | 0.786 |
| -2.12000000000004 | 1.427 | 0 | 0.793 |
| -2.11750000000004 | 1.412 | 0 | 0.801 |
| -2.11500000000004 | 1.396 | 0 | 0.809 |
| -2.11250000000004 | 1.381 | 0 | 0.817 |
| -2.11000000000004 | 1.365 | 0 | 0.824 |
| -2.10750000000004 | 1.35 | 0 | 0.832 |
| -2.10500000000004 | 1.335 | 0 | 0.84 |
| -2.10250000000004 | 1.32 | 0 | 0.848 |
| -2.10000000000004 | 1.305 | 0 | 0.856 |
| -2.097500000000041 | 1.291 | 0 | 0.864 |
| -2.095000000000041 | 1.276 | 0 | 0.872 |
| -2.092500000000041 | 1.262 | 0 | 0.881 |
| -2.090000000000041 | 1.248 | 0 | 0.889 |
| -2.087500000000041 | 1.234 | 0 | 0.897 |
| -2.085000000000041 | 1.22 | 0 | 0.905 |
| -2.082500000000041 | 1.206 | 0 | 0.914 |
| -2.080000000000041 | 1.192 | 0 | 0.922 |
| -2.077500000000041 | 1.179 | 0 | 0.93 |
| -2.075000000000041 | 1.165 | 0 | 0.939 |
| -2.072500000000041 | 1.152 | 0 | 0.948 |
| -2.070000000000041 | 1.139 | 0 | 0.956 |
| -2.067500000000041 | 1.126 | 0 | 0.965 |
| -2.065000000000041 | 1.113 | 0 | 0.973 |
| -2.062500000000041 | 1.1 | 0 | 0.982 |
| -2.060000000000041 | 1.087 | 0 | 0.991 |
| -2.057500000000041 | 1.075 | 0 | 1 |
| -2.055000000000041 | 1.062 | 0 | 1.009 |
| -2.052500000000042 | 1.05 | 0 | 1.018 |
| -2.050000000000042 | 1.038 | 0 | 1.027 |
| -2.047500000000042 | 1.026 | 0 | 1.036 |
| -2.045000000000042 | 1.014 | 0 | 1.045 |
| -2.042500000000042 | 1.002 | 0 | 1.054 |
| -2.040000000000042 | 0.99 | 0 | 1.063 |
| -2.037500000000042 | 0.978 | 0 | 1.072 |
| -2.035000000000042 | 0.967 | 0 | 1.082 |
| -2.032500000000042 | 0.955 | 0 | 1.091 |
| -2.030000000000042 | 0.944 | 0 | 1.1 |
| -2.027500000000042 | 0.933 | 0 | 1.11 |
| -2.025000000000042 | 0.922 | 0 | 1.119 |
| -2.022500000000042 | 0.911 | 0 | 1.129 |
| -2.020000000000042 | 0.9 | 0 | 1.138 |
| -2.017500000000042 | 0.889 | 0 | 1.148 |
| -2.015000000000042 | 0.878 | 0 | 1.158 |
| -2.012500000000042 | 0.868 | 0 | 1.167 |
| -2.010000000000042 | 0.857 | 0 | 1.177 |
| -2.007500000000042 | 0.847 | 0 | 1.187 |
| -2.005000000000043 | 0.837 | 0 | 1.197 |
| -2.002500000000043 | 0.827 | 0 | 1.207 |
| -2.000000000000043 | 0.817 | 0 | 1.217 |
| -1.997500000000043 | 0.807 | 0 | 1.227 |
| -1.995000000000043 | 0.797 | 0 | 1.237 |
| -1.992500000000043 | 0.787 | 0 | 1.247 |
| -1.990000000000043 | 0.777 | 0 | 1.257 |
| -1.987500000000043 | 0.768 | 0 | 1.267 |
| -1.985000000000043 | 0.758 | 0 | 1.278 |
| -1.982500000000043 | 0.749 | 0 | 1.288 |
| -1.980000000000043 | 0.74 | 0 | 1.298 |
| -1.977500000000043 | 0.731 | 0 | 1.309 |
| -1.975000000000043 | 0.722 | 0 | 1.319 |
| -1.972500000000043 | 0.713 | 0 | 1.33 |
| -1.970000000000043 | 0.704 | 0 | 1.34 |
| -1.967500000000043 | 0.695 | 0 | 1.351 |
| -1.965000000000043 | 0.686 | 0 | 1.362 |
| -1.962500000000043 | 0.677 | 0 | 1.372 |
| -1.960000000000043 | 0.669 | 0 | 1.383 |
| -1.957500000000044 | 0.66 | 0 | 1.394 |
| -1.955000000000044 | 0.652 | 0 | 1.405 |
| -1.952500000000044 | 0.644 | 0 | 1.416 |
| -1.950000000000044 | 0.636 | 0 | 1.427 |
| -1.947500000000044 | 0.628 | 0 | 1.438 |
| -1.945000000000044 | 0.62 | 0 | 1.449 |
| -1.942500000000044 | 0.612 | 0 | 1.46 |
| -1.940000000000044 | 0.604 | 0 | 1.471 |
| -1.937500000000044 | 0.596 | 0 | 1.482 |
| -1.935000000000044 | 0.588 | 0 | 1.494 |
| -1.932500000000044 | 0.581 | 0 | 1.505 |
| -1.930000000000044 | 0.573 | 0 | 1.516 |
| -1.927500000000044 | 0.566 | 0 | 1.528 |
| -1.925000000000044 | 0.558 | 0 | 1.539 |
| -1.922500000000044 | 0.551 | 0 | 1.551 |
| -1.920000000000044 | 0.544 | 0 | 1.562 |
| -1.917500000000044 | 0.537 | 0 | 1.574 |
| -1.915000000000044 | 0.53 | 0 | 1.586 |
| -1.912500000000044 | 0.523 | 0 | 1.597 |
| -1.910000000000045 | 0.516 | 0 | 1.609 |
| -1.907500000000045 | 0.509 | 0 | 1.621 |
| -1.905000000000045 | 0.502 | 0 | 1.633 |
| -1.902500000000045 | 0.495 | 0 | 1.645 |
| -1.900000000000045 | 0.489 | 0 | 1.657 |
| -1.897500000000045 | 0.482 | 0 | 1.669 |
| -1.895000000000045 | 0.476 | 0 | 1.681 |
| -1.892500000000045 | 0.469 | 0 | 1.693 |
| -1.890000000000045 | 0.463 | 0 | 1.705 |
| -1.887500000000045 | 0.457 | 0 | 1.718 |
| -1.885000000000045 | 0.451 | 0 | 1.73 |
| -1.882500000000045 | 0.444 | 0 | 1.742 |
| -1.880000000000045 | 0.438 | 0 | 1.755 |
| -1.877500000000045 | 0.432 | 0 | 1.767 |
| -1.875000000000045 | 0.427 | 0 | 1.78 |
| -1.872500000000045 | 0.421 | 0 | 1.792 |
| -1.870000000000045 | 0.415 | 0 | 1.805 |
| -1.867500000000045 | 0.409 | 0 | 1.817 |
| -1.865000000000045 | 0.403 | 0 | 1.83 |
| -1.862500000000046 | 0.398 | 0 | 1.843 |
| -1.860000000000046 | 0.392 | 0 | 1.855 |
| -1.857500000000046 | 0.387 | 0 | 1.868 |
| -1.855000000000046 | 0.381 | 0 | 1.881 |
| -1.852500000000046 | 0.376 | 0 | 1.894 |
| -1.850000000000046 | 0.371 | 0 | 1.907 |
| -1.847500000000046 | 0.366 | 0 | 1.92 |
| -1.845000000000046 | 0.36 | 0.001 | 1.933 |
| -1.842500000000046 | 0.355 | 0.001 | 1.946 |
| -1.840000000000046 | 0.35 | 0.001 | 1.96 |
| -1.837500000000046 | 0.345 | 0.001 | 1.973 |
| -1.835000000000046 | 0.34 | 0.001 | 1.986 |
| -1.832500000000046 | 0.336 | 0.001 | 1.999 |
| -1.830000000000046 | 0.331 | 0.001 | 2.013 |
| -1.827500000000046 | 0.326 | 0.001 | 2.026 |
| -1.825000000000046 | 0.321 | 0.001 | 2.04 |
| -1.822500000000046 | 0.317 | 0.001 | 2.053 |
| -1.820000000000046 | 0.312 | 0.001 | 2.067 |
| -1.817500000000046 | 0.307 | 0.001 | 2.08 |
| -1.815000000000047 | 0.303 | 0.001 | 2.094 |
| -1.812500000000047 | 0.299 | 0.001 | 2.108 |
| -1.810000000000047 | 0.294 | 0.001 | 2.122 |
| -1.807500000000047 | 0.29 | 0.001 | 2.136 |
| -1.805000000000047 | 0.286 | 0.001 | 2.149 |
| -1.802500000000047 | 0.281 | 0.001 | 2.163 |
| -1.800000000000047 | 0.277 | 0.001 | 2.177 |
| -1.797500000000047 | 0.273 | 0.001 | 2.191 |
| -1.795000000000047 | 0.269 | 0.001 | 2.205 |
| -1.792500000000047 | 0.265 | 0.002 | 2.219 |
| -1.790000000000047 | 0.261 | 0.002 | 2.234 |
| -1.787500000000047 | 0.257 | 0.002 | 2.248 |
| -1.785000000000047 | 0.253 | 0.002 | 2.262 |
| -1.782500000000047 | 0.249 | 0.002 | 2.276 |
| -1.780000000000047 | 0.246 | 0.002 | 2.291 |
| -1.777500000000047 | 0.242 | 0.002 | 2.305 |
| -1.775000000000047 | 0.238 | 0.002 | 2.32 |
| -1.772500000000047 | 0.234 | 0.002 | 2.334 |
| -1.770000000000047 | 0.231 | 0.002 | 2.349 |
| -1.767500000000048 | 0.227 | 0.002 | 2.363 |
| -1.765000000000048 | 0.224 | 0.003 | 2.378 |
| -1.762500000000048 | 0.22 | 0.003 | 2.393 |
| -1.760000000000048 | 0.217 | 0.003 | 2.407 |
| -1.757500000000048 | 0.214 | 0.003 | 2.422 |
| -1.755000000000048 | 0.21 | 0.003 | 2.437 |
| -1.752500000000048 | 0.207 | 0.003 | 2.452 |
| -1.750000000000048 | 0.204 | 0.003 | 2.467 |
| -1.747500000000048 | 0.2 | 0.003 | 2.482 |
| -1.745000000000048 | 0.197 | 0.003 | 2.497 |
| -1.742500000000048 | 0.194 | 0.004 | 2.512 |
| -1.740000000000048 | 0.191 | 0.004 | 2.527 |
| -1.737500000000048 | 0.188 | 0.004 | 2.542 |
| -1.735000000000048 | 0.185 | 0.004 | 2.557 |
| -1.732500000000048 | 0.182 | 0.004 | 2.573 |
| -1.730000000000048 | 0.179 | 0.004 | 2.588 |
| -1.727500000000048 | 0.176 | 0.004 | 2.603 |
| -1.725000000000048 | 0.173 | 0.005 | 2.619 |
| -1.722500000000048 | 0.171 | 0.005 | 2.634 |
| -1.720000000000049 | 0.168 | 0.005 | 2.65 |
| -1.717500000000049 | 0.165 | 0.005 | 2.665 |
| -1.715000000000049 | 0.162 | 0.005 | 2.681 |
| -1.712500000000049 | 0.16 | 0.005 | 2.696 |
| -1.710000000000049 | 0.157 | 0.006 | 2.712 |
| -1.707500000000049 | 0.154 | 0.006 | 2.728 |
| -1.705000000000049 | 0.152 | 0.006 | 2.744 |
| -1.702500000000049 | 0.149 | 0.006 | 2.759 |
| -1.700000000000049 | 0.147 | 0.006 | 2.775 |
| -1.697500000000049 | 0.144 | 0.006 | 2.791 |
| -1.69500000000005 | 0.142 | 0.007 | 2.807 |
| -1.69250000000005 | 0.14 | 0.007 | 2.823 |
| -1.69000000000005 | 0.137 | 0.007 | 2.839 |
| -1.687500000000049 | 0.135 | 0.007 | 2.855 |
| -1.685000000000049 | 0.133 | 0.008 | 2.871 |
| -1.682500000000049 | 0.13 | 0.008 | 2.887 |
| -1.680000000000049 | 0.128 | 0.008 | 2.904 |
| -1.677500000000049 | 0.126 | 0.008 | 2.92 |
| -1.675000000000049 | 0.124 | 0.008 | 2.936 |
| -1.67250000000005 | 0.122 | 0.009 | 2.952 |
| -1.67000000000005 | 0.119 | 0.009 | 2.969 |
| -1.66750000000005 | 0.117 | 0.009 | 2.985 |
| -1.66500000000005 | 0.115 | 0.009 | 3.002 |
| -1.66250000000005 | 0.113 | 0.01 | 3.018 |
| -1.66000000000005 | 0.111 | 0.01 | 3.035 |
| -1.65750000000005 | 0.109 | 0.01 | 3.051 |
| -1.65500000000005 | 0.107 | 0.011 | 3.068 |
| -1.65250000000005 | 0.105 | 0.011 | 3.085 |
| -1.65000000000005 | 0.104 | 0.011 | 3.101 |
| -1.64750000000005 | 0.102 | 0.011 | 3.118 |
| -1.64500000000005 | 0.1 | 0.012 | 3.135 |
| -1.64250000000005 | 0.098 | 0.012 | 3.152 |
| -1.64000000000005 | 0.096 | 0.012 | 3.169 |
| -1.63750000000005 | 0.095 | 0.013 | 3.186 |
| -1.63500000000005 | 0.093 | 0.013 | 3.203 |
| -1.63250000000005 | 0.091 | 0.013 | 3.22 |
| -1.63000000000005 | 0.09 | 0.014 | 3.237 |
| -1.62750000000005 | 0.088 | 0.014 | 3.254 |
| -1.625000000000051 | 0.086 | 0.014 | 3.271 |
| -1.622500000000051 | 0.085 | 0.015 | 3.288 |
| -1.620000000000051 | 0.083 | 0.015 | 3.305 |
| -1.617500000000051 | 0.082 | 0.015 | 3.323 |
| -1.615000000000051 | 0.08 | 0.016 | 3.34 |
| -1.612500000000051 | 0.078 | 0.016 | 3.357 |
| -1.610000000000051 | 0.077 | 0.017 | 3.375 |
| -1.607500000000051 | 0.076 | 0.017 | 3.392 |
| -1.605000000000051 | 0.074 | 0.017 | 3.41 |
| -1.602500000000051 | 0.073 | 0.018 | 3.427 |
| -1.600000000000051 | 0.071 | 0.018 | 3.445 |
| -1.597500000000051 | 0.07 | 0.019 | 3.462 |
| -1.595000000000051 | 0.069 | 0.019 | 3.48 |
| -1.592500000000051 | 0.067 | 0.019 | 3.497 |
| -1.590000000000051 | 0.066 | 0.02 | 3.515 |
| -1.587500000000051 | 0.065 | 0.02 | 3.533 |
| -1.585000000000051 | 0.063 | 0.021 | 3.551 |
| -1.582500000000052 | 0.062 | 0.021 | 3.569 |
| -1.580000000000052 | 0.061 | 0.022 | 3.586 |
| -1.577500000000052 | 0.06 | 0.022 | 3.604 |
| -1.575000000000052 | 0.058 | 0.023 | 3.622 |
| -1.572500000000052 | 0.057 | 0.023 | 3.64 |
| -1.570000000000052 | 0.056 | 0.023 | 3.658 |
| -1.567500000000052 | 0.055 | 0.024 | 3.676 |
| -1.565000000000052 | 0.054 | 0.024 | 3.694 |
| -1.562500000000052 | 0.053 | 0.025 | 3.712 |
| -1.560000000000052 | 0.052 | 0.025 | 3.731 |
| -1.557500000000052 | 0.051 | 0.026 | 3.749 |
| -1.555000000000052 | 0.05 | 0.027 | 3.767 |
| -1.552500000000052 | 0.049 | 0.027 | 3.785 |
| -1.550000000000052 | 0.048 | 0.028 | 3.803 |
| -1.547500000000052 | 0.047 | 0.028 | 3.822 |
| -1.545000000000052 | 0.046 | 0.029 | 3.84 |
| -1.542500000000052 | 0.045 | 0.029 | 3.859 |
| -1.540000000000052 | 0.044 | 0.03 | 3.877 |
| -1.537500000000052 | 0.043 | 0.03 | 3.895 |
| -1.535000000000053 | 0.042 | 0.031 | 3.914 |
| -1.532500000000053 | 0.041 | 0.032 | 3.933 |
| -1.530000000000053 | 0.04 | 0.032 | 3.951 |
| -1.527500000000053 | 0.039 | 0.033 | 3.97 |
| -1.525000000000053 | 0.038 | 0.033 | 3.988 |
| -1.522500000000053 | 0.038 | 0.034 | 4.007 |
| -1.520000000000053 | 0.037 | 0.035 | 4.026 |
| -1.517500000000053 | 0.036 | 0.035 | 4.044 |
| -1.515000000000053 | 0.035 | 0.036 | 4.063 |
| -1.512500000000053 | 0.034 | 0.037 | 4.082 |
| -1.510000000000053 | 0.034 | 0.037 | 4.101 |
| -1.507500000000053 | 0.033 | 0.038 | 4.12 |
| -1.505000000000053 | 0.032 | 0.039 | 4.139 |
| -1.502500000000053 | 0.031 | 0.039 | 4.158 |
| -1.500000000000053 | 0.031 | 0.04 | 4.177 |
| -1.497500000000053 | 0.03 | 0.041 | 4.196 |
| -1.495000000000053 | 0.029 | 0.042 | 4.215 |
| -1.492500000000053 | 0.029 | 0.042 | 4.234 |
| -1.490000000000053 | 0.028 | 0.043 | 4.253 |
| -1.487500000000054 | 0.027 | 0.044 | 4.272 |
| -1.485000000000054 | 0.027 | 0.044 | 4.291 |
| -1.482500000000054 | 0.026 | 0.045 | 4.31 |
| -1.480000000000054 | 0.026 | 0.046 | 4.329 |
| -1.477500000000054 | 0.025 | 0.047 | 4.349 |
| -1.475000000000054 | 0.024 | 0.048 | 4.368 |
| -1.472500000000054 | 0.024 | 0.048 | 4.387 |
| -1.470000000000054 | 0.023 | 0.049 | 4.407 |
| -1.467500000000054 | 0.023 | 0.05 | 4.426 |
| -1.465000000000054 | 0.022 | 0.051 | 4.445 |
| -1.462500000000054 | 0.022 | 0.052 | 4.465 |
| -1.460000000000054 | 0.021 | 0.052 | 4.484 |
| -1.457500000000054 | 0.02 | 0.053 | 4.504 |
| -1.455000000000054 | 0.02 | 0.054 | 4.523 |
| -1.452500000000054 | 0.02 | 0.055 | 4.543 |
| -1.450000000000054 | 0.019 | 0.056 | 4.562 |
| -1.447500000000054 | 0.019 | 0.057 | 4.582 |
| -1.445000000000054 | 0.018 | 0.058 | 4.601 |
| -1.442500000000054 | 0.018 | 0.059 | 4.621 |
| -1.440000000000055 | 0.017 | 0.059 | 4.641 |
| -1.437500000000055 | 0.017 | 0.06 | 4.66 |
| -1.435000000000055 | 0.016 | 0.061 | 4.68 |
| -1.432500000000055 | 0.016 | 0.062 | 4.7 |
| -1.430000000000055 | 0.015 | 0.063 | 4.72 |
| -1.427500000000055 | 0.015 | 0.064 | 4.74 |
| -1.425000000000055 | 0.015 | 0.065 | 4.759 |
| -1.422500000000055 | 0.014 | 0.066 | 4.779 |
| -1.420000000000055 | 0.014 | 0.067 | 4.799 |
| -1.417500000000055 | 0.014 | 0.068 | 4.819 |
| -1.415000000000055 | 0.013 | 0.069 | 4.839 |
| -1.412500000000055 | 0.013 | 0.07 | 4.859 |
| -1.410000000000055 | 0.012 | 0.071 | 4.879 |
| -1.407500000000055 | 0.012 | 0.072 | 4.899 |
| -1.405000000000055 | 0.012 | 0.073 | 4.919 |
| -1.402500000000055 | 0.011 | 0.074 | 4.939 |
| -1.400000000000055 | 0.011 | 0.075 | 4.959 |
| -1.397500000000055 | 0.011 | 0.076 | 4.979 |
| -1.395000000000055 | 0.011 | 0.077 | 4.999 |
| -1.392500000000056 | 0.01 | 0.078 | 5.019 |
| -1.390000000000056 | 0.01 | 0.079 | 5.039 |
| -1.387500000000056 | 0.01 | 0.081 | 5.06 |
| -1.385000000000056 | 0.009 | 0.082 | 5.08 |
| -1.382500000000056 | 0.009 | 0.083 | 5.1 |
| -1.380000000000056 | 0.009 | 0.084 | 5.12 |
| -1.377500000000056 | 0.009 | 0.085 | 5.14 |
| -1.375000000000056 | 0.008 | 0.086 | 5.161 |
| -1.372500000000056 | 0.008 | 0.087 | 5.181 |
| -1.370000000000056 | 0.008 | 0.089 | 5.201 |
| -1.367500000000056 | 0.008 | 0.09 | 5.222 |
| -1.365000000000056 | 0.007 | 0.091 | 5.242 |
| -1.362500000000056 | 0.007 | 0.092 | 5.262 |
| -1.360000000000056 | 0.007 | 0.093 | 5.283 |
| -1.357500000000056 | 0.007 | 0.095 | 5.303 |
| -1.355000000000056 | 0.007 | 0.096 | 5.324 |
| -1.352500000000056 | 0.006 | 0.097 | 5.344 |
| -1.350000000000056 | 0.006 | 0.098 | 5.364 |
| -1.347500000000056 | 0.006 | 0.1 | 5.385 |
| -1.345000000000057 | 0.006 | 0.101 | 5.405 |
| -1.342500000000057 | 0.006 | 0.102 | 5.426 |
| -1.340000000000057 | 0.005 | 0.103 | 5.446 |
| -1.337500000000057 | 0.005 | 0.105 | 5.467 |
| -1.335000000000057 | 0.005 | 0.106 | 5.488 |
| -1.332500000000057 | 0.005 | 0.107 | 5.508 |
| -1.330000000000057 | 0.005 | 0.109 | 5.529 |
| -1.327500000000057 | 0.005 | 0.11 | 5.549 |
| -1.325000000000057 | 0.004 | 0.111 | 5.57 |
| -1.322500000000057 | 0.004 | 0.113 | 5.591 |
| -1.320000000000057 | 0.004 | 0.114 | 5.611 |
| -1.317500000000057 | 0.004 | 0.115 | 5.632 |
| -1.315000000000057 | 0.004 | 0.117 | 5.653 |
| -1.312500000000057 | 0.004 | 0.118 | 5.673 |
| -1.310000000000057 | 0.004 | 0.12 | 5.694 |
| -1.307500000000057 | 0.003 | 0.121 | 5.715 |
| -1.305000000000057 | 0.003 | 0.122 | 5.735 |
| -1.302500000000057 | 0.003 | 0.124 | 5.756 |
| -1.300000000000058 | 0.003 | 0.125 | 5.777 |
| -1.297500000000058 | 0.003 | 0.127 | 5.798 |
| -1.295000000000058 | 0.003 | 0.128 | 5.818 |
| -1.292500000000058 | 0.003 | 0.13 | 5.839 |
| -1.290000000000058 | 0.003 | 0.131 | 5.86 |
| -1.287500000000058 | 0.003 | 0.133 | 5.881 |
| -1.285000000000058 | 0.002 | 0.134 | 5.902 |
| -1.282500000000058 | 0.002 | 0.136 | 5.922 |
| -1.280000000000058 | 0.002 | 0.137 | 5.943 |
| -1.277500000000058 | 0.002 | 0.139 | 5.964 |
| -1.275000000000058 | 0.002 | 0.14 | 5.985 |
| -1.272500000000058 | 0.002 | 0.142 | 6.006 |
| -1.270000000000058 | 0.002 | 0.143 | 6.027 |
| -1.267500000000058 | 0.002 | 0.145 | 6.048 |
| -1.265000000000058 | 0.002 | 0.147 | 6.068 |
| -1.262500000000058 | 0.002 | 0.148 | 6.089 |
| -1.260000000000058 | 0.002 | 0.15 | 6.11 |
| -1.257500000000058 | 0.002 | 0.151 | 6.131 |
| -1.255000000000058 | 0.002 | 0.153 | 6.152 |
| -1.252500000000059 | 0.001 | 0.155 | 6.173 |
| -1.250000000000059 | 0.001 | 0.156 | 6.194 |
| -1.247500000000059 | 0.001 | 0.158 | 6.215 |
| -1.245000000000059 | 0.001 | 0.16 | 6.236 |
| -1.242500000000059 | 0.001 | 0.161 | 6.257 |
| -1.240000000000059 | 0.001 | 0.163 | 6.278 |
| -1.237500000000059 | 0.001 | 0.165 | 6.299 |
| -1.235000000000059 | 0.001 | 0.166 | 6.32 |
| -1.232500000000059 | 0.001 | 0.168 | 6.341 |
| -1.23000000000006 | 0.001 | 0.17 | 6.362 |
| -1.227500000000059 | 0.001 | 0.171 | 6.383 |
| -1.225000000000059 | 0.001 | 0.173 | 6.404 |
| -1.222500000000059 | 0.001 | 0.175 | 6.425 |
| -1.220000000000059 | 0.001 | 0.177 | 6.446 |
| -1.217500000000059 | 0.001 | 0.178 | 6.467 |
| -1.215000000000059 | 0.001 | 0.18 | 6.488 |
| -1.212500000000059 | 0.001 | 0.182 | 6.509 |
| -1.210000000000059 | 0.001 | 0.184 | 6.53 |
| -1.20750000000006 | 0.001 | 0.186 | 6.551 |
| -1.20500000000006 | 0.001 | 0.187 | 6.571 |
| -1.20250000000006 | 0.001 | 0.189 | 6.592 |
| -1.20000000000006 | 0.001 | 0.191 | 6.613 |
| -1.19750000000006 | 0.001 | 0.193 | 6.634 |
| -1.19500000000006 | 0 | 0.195 | 6.655 |
| -1.19250000000006 | 0 | 0.197 | 6.676 |
| -1.19000000000006 | 0 | 0.199 | 6.697 |
| -1.18750000000006 | 0 | 0.2 | 6.718 |
| -1.18500000000006 | 0 | 0.202 | 6.739 |
| -1.18250000000006 | 0 | 0.204 | 6.76 |
| -1.18000000000006 | 0 | 0.206 | 6.781 |
| -1.17750000000006 | 0 | 0.208 | 6.802 |
| -1.17500000000006 | 0 | 0.21 | 6.823 |
| -1.17250000000006 | 0 | 0.212 | 6.844 |
| -1.17000000000006 | 0 | 0.214 | 6.865 |
| -1.16750000000006 | 0 | 0.216 | 6.886 |
| -1.16500000000006 | 0 | 0.218 | 6.907 |
| -1.16250000000006 | 0 | 0.22 | 6.928 |
| -1.160000000000061 | 0 | 0.222 | 6.949 |
| -1.157500000000061 | 0 | 0.224 | 6.97 |
| -1.155000000000061 | 0 | 0.226 | 6.991 |
| -1.152500000000061 | 0 | 0.228 | 7.012 |
| -1.150000000000061 | 0 | 0.23 | 7.033 |
| -1.147500000000061 | 0 | 0.232 | 7.054 |
| -1.145000000000061 | 0 | 0.234 | 7.075 |
| -1.142500000000061 | 0 | 0.236 | 7.096 |
| -1.140000000000061 | 0 | 0.238 | 7.117 |
| -1.137500000000061 | 0 | 0.24 | 7.138 |
| -1.135000000000061 | 0 | 0.242 | 7.158 |
| -1.132500000000061 | 0 | 0.244 | 7.179 |
| -1.130000000000061 | 0 | 0.246 | 7.2 |
| -1.127500000000061 | 0 | 0.249 | 7.221 |
| -1.125000000000061 | 0 | 0.251 | 7.242 |
| -1.122500000000061 | 0 | 0.253 | 7.263 |
| -1.120000000000061 | 0 | 0.255 | 7.284 |
| -1.117500000000061 | 0 | 0.257 | 7.304 |
| -1.115000000000061 | 0 | 0.259 | 7.325 |
| -1.112500000000062 | 0 | 0.261 | 7.346 |
| -1.110000000000062 | 0 | 0.264 | 7.367 |
| -1.107500000000062 | 0 | 0.266 | 7.388 |
| -1.105000000000062 | 0 | 0.268 | 7.408 |
| -1.102500000000062 | 0 | 0.27 | 7.429 |
| -1.100000000000062 | 0 | 0.272 | 7.45 |
| -1.097500000000062 | 0 | 0.274 | 7.471 |
| -1.095000000000062 | 0 | 0.277 | 7.491 |
| -1.092500000000062 | 0 | 0.279 | 7.512 |
| -1.090000000000062 | 0 | 0.281 | 7.533 |
| -1.087500000000062 | 0 | 0.283 | 7.554 |
| -1.085000000000062 | 0 | 0.286 | 7.574 |
| -1.082500000000062 | 0 | 0.288 | 7.595 |
| -1.080000000000062 | 0 | 0.29 | 7.616 |
| -1.077500000000062 | 0 | 0.292 | 7.636 |
| -1.075000000000062 | 0 | 0.295 | 7.657 |
| -1.072500000000062 | 0 | 0.297 | 7.677 |
| -1.070000000000062 | 0 | 0.299 | 7.698 |
| -1.067500000000062 | 0 | 0.302 | 7.719 |
| -1.065000000000063 | 0 | 0.304 | 7.739 |
| -1.062500000000063 | 0 | 0.306 | 7.76 |
| -1.060000000000063 | 0 | 0.309 | 7.78 |
| -1.057500000000063 | 0 | 0.311 | 7.801 |
| -1.055000000000063 | 0 | 0.313 | 7.821 |
| -1.052500000000063 | 0 | 0.316 | 7.842 |
| -1.050000000000063 | 0 | 0.318 | 7.862 |
| -1.047500000000063 | 0 | 0.32 | 7.883 |
| -1.045000000000063 | 0 | 0.323 | 7.903 |
| -1.042500000000063 | 0 | 0.325 | 7.923 |
| -1.040000000000063 | 0 | 0.328 | 7.944 |
| -1.037500000000063 | 0 | 0.33 | 7.964 |
| -1.035000000000063 | 0 | 0.332 | 7.984 |
| -1.032500000000063 | 0 | 0.335 | 8.005 |
| -1.030000000000063 | 0 | 0.337 | 8.025 |
| -1.027500000000063 | 0 | 0.34 | 8.045 |
| -1.025000000000063 | 0 | 0.342 | 8.065 |
| -1.022500000000063 | 0 | 0.344 | 8.086 |
| -1.020000000000064 | 0 | 0.347 | 8.106 |
| -1.017500000000064 | 0 | 0.349 | 8.126 |
| -1.015000000000064 | 0 | 0.352 | 8.146 |
| -1.012500000000064 | 0 | 0.354 | 8.166 |
| -1.010000000000064 | 0 | 0.357 | 8.186 |
| -1.007500000000064 | 0 | 0.359 | 8.207 |
| -1.005000000000064 | 0 | 0.362 | 8.227 |
| -1.002500000000064 | 0 | 0.364 | 8.247 |
| -1.000000000000064 | 0 | 0.367 | 8.267 |
| -0.997500000000064 | 0 | 0.369 | 8.287 |
| -0.995000000000064 | 0 | 0.372 | 8.307 |
| -0.992500000000064 | 0 | 0.374 | 8.327 |
| -0.990000000000064 | 0 | 0.377 | 8.346 |
| -0.987500000000064 | 0 | 0.379 | 8.366 |
| -0.985000000000064 | 0 | 0.382 | 8.386 |
| -0.982500000000064 | 0 | 0.384 | 8.406 |
| -0.980000000000064 | 0 | 0.387 | 8.426 |
| -0.977500000000064 | 0 | 0.389 | 8.446 |
| -0.975000000000064 | 0 | 0.392 | 8.465 |
| -0.972500000000065 | 0 | 0.395 | 8.485 |
| -0.970000000000065 | 0 | 0.397 | 8.505 |
| -0.967500000000065 | 0 | 0.4 | 8.524 |
| -0.965000000000065 | 0 | 0.402 | 8.544 |
| -0.962500000000065 | 0 | 0.405 | 8.564 |
| -0.960000000000065 | 0 | 0.407 | 8.583 |
| -0.957500000000065 | 0 | 0.41 | 8.603 |
| -0.955000000000065 | 0 | 0.413 | 8.622 |
| -0.952500000000065 | 0 | 0.415 | 8.642 |
| -0.950000000000065 | 0 | 0.418 | 8.661 |
| -0.947500000000065 | 0 | 0.42 | 8.681 |
| -0.945000000000065 | 0 | 0.423 | 8.7 |
| -0.942500000000065 | 0 | 0.426 | 8.719 |
| -0.940000000000065 | 0 | 0.428 | 8.739 |
| -0.937500000000065 | 0 | 0.431 | 8.758 |
| -0.935000000000065 | 0 | 0.434 | 8.777 |
| -0.932500000000065 | 0 | 0.436 | 8.797 |
| -0.930000000000065 | 0 | 0.439 | 8.816 |
| -0.927500000000065 | 0 | 0.442 | 8.835 |
| -0.925000000000066 | 0 | 0.444 | 8.854 |
| -0.922500000000066 | 0 | 0.447 | 8.873 |
| -0.920000000000066 | 0 | 0.45 | 8.892 |
| -0.917500000000066 | 0 | 0.452 | 8.911 |
| -0.915000000000066 | 0 | 0.455 | 8.93 |
| -0.912500000000066 | 0 | 0.458 | 8.949 |
| -0.910000000000066 | 0 | 0.46 | 8.968 |
| -0.907500000000066 | 0 | 0.463 | 8.987 |
| -0.905000000000066 | 0 | 0.466 | 9.006 |
| -0.902500000000066 | 0 | 0.468 | 9.025 |
| -0.900000000000066 | 0 | 0.471 | 9.043 |
| -0.897500000000066 | 0 | 0.474 | 9.062 |
| -0.895000000000066 | 0 | 0.476 | 9.081 |
| -0.892500000000066 | 0 | 0.479 | 9.099 |
| -0.890000000000066 | 0 | 0.482 | 9.118 |
| -0.887500000000066 | 0 | 0.484 | 9.137 |
| -0.885000000000066 | 0 | 0.487 | 9.155 |
| -0.882500000000066 | 0 | 0.49 | 9.174 |
| -0.880000000000066 | 0 | 0.493 | 9.192 |
| -0.877500000000067 | 0 | 0.495 | 9.211 |
| -0.875000000000067 | 0 | 0.498 | 9.229 |
| -0.872500000000067 | 0 | 0.501 | 9.247 |
| -0.870000000000067 | 0 | 0.504 | 9.266 |
| -0.867500000000067 | 0 | 0.506 | 9.284 |
| -0.865000000000067 | 0 | 0.509 | 9.302 |
| -0.862500000000067 | 0 | 0.512 | 9.32 |
| -0.860000000000067 | 0 | 0.514 | 9.338 |
| -0.857500000000067 | 0 | 0.517 | 9.357 |
| -0.855000000000067 | 0 | 0.52 | 9.375 |
| -0.852500000000067 | 0 | 0.523 | 9.393 |
| -0.850000000000067 | 0 | 0.525 | 9.411 |
| -0.847500000000067 | 0 | 0.528 | 9.429 |
| -0.845000000000067 | 0 | 0.531 | 9.446 |
| -0.842500000000067 | 0 | 0.534 | 9.464 |
| -0.840000000000067 | 0 | 0.536 | 9.482 |
| -0.837500000000067 | 0 | 0.539 | 9.5 |
| -0.835000000000067 | 0 | 0.542 | 9.518 |
| -0.832500000000067 | 0 | 0.545 | 9.535 |
| -0.830000000000068 | 0 | 0.547 | 9.553 |
| -0.827500000000068 | 0 | 0.55 | 9.57 |
| -0.825000000000068 | 0 | 0.553 | 9.588 |
| -0.822500000000068 | 0 | 0.556 | 9.605 |
| -0.820000000000068 | 0 | 0.558 | 9.623 |
| -0.817500000000068 | 0 | 0.561 | 9.64 |
| -0.815000000000068 | 0 | 0.564 | 9.658 |
| -0.812500000000068 | 0 | 0.567 | 9.675 |
| -0.810000000000068 | 0 | 0.57 | 9.692 |
| -0.807500000000068 | 0 | 0.572 | 9.709 |
| -0.805000000000068 | 0 | 0.575 | 9.726 |
| -0.802500000000068 | 0 | 0.578 | 9.744 |
| -0.800000000000068 | 0 | 0.581 | 9.761 |
| -0.797500000000068 | 0 | 0.583 | 9.778 |
| -0.795000000000068 | 0 | 0.586 | 9.795 |
| -0.792500000000068 | 0 | 0.589 | 9.812 |
| -0.790000000000068 | 0 | 0.592 | 9.828 |
| -0.787500000000068 | 0 | 0.594 | 9.845 |
| -0.785000000000068 | 0 | 0.597 | 9.862 |
| -0.782500000000069 | 0 | 0.6 | 9.879 |
| -0.780000000000069 | 0 | 0.603 | 9.895 |
| -0.777500000000069 | 0 | 0.605 | 9.912 |
| -0.775000000000069 | 0 | 0.608 | 9.929 |
| -0.772500000000069 | 0 | 0.611 | 9.945 |
| -0.770000000000069 | 0 | 0.614 | 9.962 |
| -0.767500000000069 | 0 | 0.617 | 9.978 |
| -0.765000000000069 | 0.001 | 0.619 | 9.994 |
| -0.762500000000069 | 0.001 | 0.622 | 10.011 |
| -0.760000000000069 | 0.001 | 0.625 | 10.027 |
| -0.757500000000069 | 0.001 | 0.628 | 10.043 |
| -0.755000000000069 | 0.001 | 0.63 | 10.059 |
| -0.752500000000069 | 0.001 | 0.633 | 10.075 |
| -0.750000000000069 | 0.001 | 0.636 | 10.091 |
| -0.747500000000069 | 0.001 | 0.639 | 10.107 |
| -0.745000000000069 | 0.001 | 0.641 | 10.123 |
| -0.742500000000069 | 0.001 | 0.644 | 10.139 |
| -0.740000000000069 | 0.001 | 0.647 | 10.155 |
| -0.737500000000069 | 0.001 | 0.649 | 10.171 |
| -0.73500000000007 | 0.001 | 0.652 | 10.187 |
| -0.73250000000007 | 0.001 | 0.655 | 10.202 |
| -0.73000000000007 | 0.001 | 0.658 | 10.218 |
| -0.72750000000007 | 0.001 | 0.66 | 10.233 |
| -0.72500000000007 | 0.001 | 0.663 | 10.249 |
| -0.72250000000007 | 0.001 | 0.666 | 10.264 |
| -0.72000000000007 | 0.001 | 0.669 | 10.28 |
| -0.71750000000007 | 0.001 | 0.671 | 10.295 |
| -0.71500000000007 | 0.001 | 0.674 | 10.31 |
| -0.71250000000007 | 0.001 | 0.677 | 10.326 |
| -0.71000000000007 | 0.001 | 0.679 | 10.341 |
| -0.70750000000007 | 0.001 | 0.682 | 10.356 |
| -0.70500000000007 | 0.001 | 0.685 | 10.371 |
| -0.70250000000007 | 0.001 | 0.688 | 10.386 |
| -0.70000000000007 | 0.001 | 0.69 | 10.401 |
| -0.69750000000007 | 0.001 | 0.693 | 10.416 |
| -0.69500000000007 | 0.001 | 0.696 | 10.43 |
| -0.69250000000007 | 0.001 | 0.698 | 10.445 |
| -0.69000000000007 | 0.001 | 0.701 | 10.46 |
| -0.687500000000071 | 0.001 | 0.704 | 10.475 |
| -0.685000000000071 | 0.001 | 0.706 | 10.489 |
| -0.682500000000071 | 0.001 | 0.709 | 10.504 |
| -0.680000000000071 | 0.001 | 0.712 | 10.518 |
| -0.677500000000071 | 0.001 | 0.714 | 10.533 |
| -0.675000000000071 | 0.002 | 0.717 | 10.547 |
| -0.672500000000071 | 0.002 | 0.72 | 10.561 |
| -0.670000000000071 | 0.002 | 0.722 | 10.575 |
| -0.667500000000071 | 0.002 | 0.725 | 10.59 |
| -0.665000000000071 | 0.002 | 0.727 | 10.604 |
| -0.662500000000071 | 0.002 | 0.73 | 10.618 |
| -0.660000000000071 | 0.002 | 0.733 | 10.632 |
| -0.657500000000071 | 0.002 | 0.735 | 10.646 |
| -0.655000000000071 | 0.002 | 0.738 | 10.659 |
| -0.652500000000071 | 0.002 | 0.741 | 10.673 |
| -0.650000000000071 | 0.002 | 0.743 | 10.687 |
| -0.647500000000071 | 0.002 | 0.746 | 10.701 |
| -0.645000000000071 | 0.002 | 0.748 | 10.714 |
| -0.642500000000071 | 0.002 | 0.751 | 10.728 |
| -0.640000000000072 | 0.002 | 0.754 | 10.741 |
| -0.637500000000072 | 0.002 | 0.756 | 10.755 |
| -0.635000000000072 | 0.002 | 0.759 | 10.768 |
| -0.632500000000072 | 0.002 | 0.761 | 10.781 |
| -0.630000000000072 | 0.002 | 0.764 | 10.795 |
| -0.627500000000072 | 0.002 | 0.766 | 10.808 |
| -0.625000000000072 | 0.002 | 0.769 | 10.821 |
| -0.622500000000072 | 0.002 | 0.771 | 10.834 |
| -0.620000000000072 | 0.003 | 0.774 | 10.847 |
| -0.617500000000072 | 0.003 | 0.776 | 10.86 |
| -0.615000000000072 | 0.003 | 0.779 | 10.873 |
| -0.612500000000072 | 0.003 | 0.781 | 10.886 |
| -0.610000000000072 | 0.003 | 0.784 | 10.898 |
| -0.607500000000072 | 0.003 | 0.786 | 10.911 |
| -0.605000000000072 | 0.003 | 0.789 | 10.924 |
| -0.602500000000072 | 0.003 | 0.791 | 10.936 |
| -0.600000000000072 | 0.003 | 0.794 | 10.949 |
| -0.597500000000073 | 0.003 | 0.796 | 10.961 |
| -0.595000000000073 | 0.003 | 0.799 | 10.973 |
| -0.592500000000073 | 0.003 | 0.801 | 10.986 |
| -0.590000000000073 | 0.003 | 0.804 | 10.998 |
| -0.587500000000073 | 0.003 | 0.806 | 11.01 |
| -0.585000000000073 | 0.003 | 0.809 | 11.022 |
| -0.582500000000073 | 0.003 | 0.811 | 11.034 |
| -0.580000000000073 | 0.003 | 0.813 | 11.046 |
| -0.577500000000073 | 0.004 | 0.816 | 11.058 |
| -0.575000000000073 | 0.004 | 0.818 | 11.07 |
| -0.572500000000073 | 0.004 | 0.821 | 11.082 |
| -0.570000000000073 | 0.004 | 0.823 | 11.093 |
| -0.567500000000073 | 0.004 | 0.825 | 11.105 |
| -0.565000000000073 | 0.004 | 0.828 | 11.116 |
| -0.562500000000073 | 0.004 | 0.83 | 11.128 |
| -0.560000000000073 | 0.004 | 0.832 | 11.139 |
| -0.557500000000073 | 0.004 | 0.835 | 11.151 |
| -0.555000000000073 | 0.004 | 0.837 | 11.162 |
| -0.552500000000073 | 0.004 | 0.839 | 11.173 |
| -0.550000000000074 | 0.004 | 0.842 | 11.184 |
| -0.547500000000074 | 0.004 | 0.844 | 11.195 |
| -0.545000000000074 | 0.004 | 0.846 | 11.206 |
| -0.542500000000074 | 0.004 | 0.849 | 11.217 |
| -0.540000000000074 | 0.005 | 0.851 | 11.228 |
| -0.537500000000074 | 0.005 | 0.853 | 11.239 |
| -0.535000000000074 | 0.005 | 0.855 | 11.25 |
| -0.532500000000074 | 0.005 | 0.858 | 11.261 |
| -0.530000000000074 | 0.005 | 0.86 | 11.271 |
| -0.527500000000074 | 0.005 | 0.862 | 11.282 |
| -0.525000000000074 | 0.005 | 0.864 | 11.292 |
| -0.522500000000074 | 0.005 | 0.867 | 11.303 |
| -0.520000000000074 | 0.005 | 0.869 | 11.313 |
| -0.517500000000074 | 0.005 | 0.871 | 11.323 |
| -0.515000000000074 | 0.005 | 0.873 | 11.333 |
| -0.512500000000074 | 0.005 | 0.875 | 11.344 |
| -0.510000000000074 | 0.005 | 0.877 | 11.354 |
| -0.507500000000074 | 0.005 | 0.88 | 11.364 |
| -0.505000000000074 | 0.006 | 0.882 | 11.374 |
| -0.502500000000075 | 0.006 | 0.884 | 11.383 |
| -0.500000000000075 | 0.006 | 0.886 | 11.393 |
| -0.497500000000075 | 0.006 | 0.888 | 11.403 |
| -0.495000000000075 | 0.006 | 0.89 | 11.413 |
| -0.492500000000075 | 0.006 | 0.892 | 11.422 |
| -0.490000000000075 | 0.006 | 0.894 | 11.432 |
| -0.487500000000075 | 0.006 | 0.896 | 11.441 |
| -0.485000000000075 | 0.006 | 0.898 | 11.451 |
| -0.482500000000075 | 0.006 | 0.9 | 11.46 |
| -0.480000000000075 | 0.006 | 0.902 | 11.469 |
| -0.477500000000075 | 0.006 | 0.904 | 11.478 |
| -0.475000000000075 | 0.007 | 0.906 | 11.487 |
| -0.472500000000075 | 0.007 | 0.908 | 11.497 |
| -0.470000000000075 | 0.007 | 0.91 | 11.505 |
| -0.467500000000075 | 0.007 | 0.912 | 11.514 |
| -0.465000000000075 | 0.007 | 0.914 | 11.523 |
| -0.462500000000075 | 0.007 | 0.916 | 11.532 |
| -0.460000000000075 | 0.007 | 0.918 | 11.541 |
| -0.457500000000075 | 0.007 | 0.92 | 11.549 |
| -0.455000000000075 | 0.007 | 0.922 | 11.558 |
| -0.452500000000075 | 0.007 | 0.924 | 11.566 |
| -0.450000000000075 | 0.007 | 0.926 | 11.575 |
| -0.447500000000075 | 0.007 | 0.928 | 11.583 |
| -0.445000000000075 | 0.008 | 0.93 | 11.591 |
| -0.442500000000075 | 0.008 | 0.932 | 11.6 |
| -0.440000000000075 | 0.008 | 0.933 | 11.608 |
| -0.437500000000075 | 0.008 | 0.935 | 11.616 |
| -0.435000000000075 | 0.008 | 0.937 | 11.624 |
| -0.432500000000075 | 0.008 | 0.939 | 11.632 |
| -0.430000000000075 | 0.008 | 0.941 | 11.64 |
| -0.427500000000075 | 0.008 | 0.942 | 11.648 |
| -0.425000000000075 | 0.008 | 0.944 | 11.655 |
| -0.422500000000075 | 0.008 | 0.946 | 11.663 |
| -0.420000000000075 | 0.008 | 0.948 | 11.671 |
| -0.417500000000075 | 0.008 | 0.949 | 11.678 |
| -0.415000000000075 | 0.009 | 0.951 | 11.686 |
| -0.412500000000075 | 0.009 | 0.953 | 11.693 |
| -0.410000000000075 | 0.009 | 0.955 | 11.7 |
| -0.407500000000075 | 0.009 | 0.956 | 11.708 |
| -0.405000000000074 | 0.009 | 0.958 | 11.715 |
| -0.402500000000074 | 0.009 | 0.96 | 11.722 |
| -0.400000000000074 | 0.009 | 0.961 | 11.729 |
| -0.397500000000074 | 0.009 | 0.963 | 11.736 |
| -0.395000000000074 | 0.009 | 0.964 | 11.743 |
| -0.392500000000074 | 0.009 | 0.966 | 11.75 |
| -0.390000000000074 | 0.009 | 0.968 | 11.757 |
| -0.387500000000074 | 0.01 | 0.969 | 11.763 |
| -0.385000000000074 | 0.01 | 0.971 | 11.77 |
| -0.382500000000074 | 0.01 | 0.972 | 11.777 |
| -0.380000000000074 | 0.01 | 0.974 | 11.783 |
| -0.377500000000074 | 0.01 | 0.975 | 11.79 |
| -0.375000000000074 | 0.01 | 0.977 | 11.796 |
| -0.372500000000074 | 0.01 | 0.978 | 11.802 |
| -0.370000000000074 | 0.01 | 0.98 | 11.809 |
| -0.367500000000074 | 0.01 | 0.981 | 11.815 |
| -0.365000000000074 | 0.01 | 0.983 | 11.821 |
| -0.362500000000074 | 0.01 | 0.984 | 11.827 |
| -0.360000000000074 | 0.01 | 0.986 | 11.833 |
| -0.357500000000074 | 0.011 | 0.987 | 11.839 |
| -0.355000000000074 | 0.011 | 0.989 | 11.845 |
| -0.352500000000074 | 0.011 | 0.99 | 11.851 |
| -0.350000000000074 | 0.011 | 0.991 | 11.856 |
| -0.347500000000074 | 0.011 | 0.993 | 11.862 |
| -0.345000000000074 | 0.011 | 0.994 | 11.868 |
| -0.342500000000074 | 0.011 | 0.995 | 11.873 |
| -0.340000000000074 | 0.011 | 0.997 | 11.879 |
| -0.337500000000074 | 0.011 | 0.998 | 11.884 |
| -0.335000000000074 | 0.011 | 0.999 | 11.889 |
| -0.332500000000074 | 0.011 | 1.001 | 11.895 |
| -0.330000000000074 | 0.011 | 1.002 | 11.9 |
| -0.327500000000074 | 0.012 | 1.003 | 11.905 |
| -0.325000000000074 | 0.012 | 1.004 | 11.91 |
| -0.322500000000074 | 0.012 | 1.006 | 11.915 |
| -0.320000000000074 | 0.012 | 1.007 | 11.92 |
| -0.317500000000074 | 0.012 | 1.008 | 11.925 |
| -0.315000000000074 | 0.012 | 1.009 | 11.93 |
| -0.312500000000074 | 0.012 | 1.01 | 11.935 |
| -0.310000000000074 | 0.012 | 1.012 | 11.939 |
| -0.307500000000074 | 0.012 | 1.013 | 11.944 |
| -0.305000000000074 | 0.012 | 1.014 | 11.948 |
| -0.302500000000074 | 0.012 | 1.015 | 11.953 |
| -0.300000000000074 | 0.012 | 1.016 | 11.957 |
| -0.297500000000074 | 0.012 | 1.017 | 11.962 |
| -0.295000000000074 | 0.013 | 1.018 | 11.966 |
| -0.292500000000074 | 0.013 | 1.019 | 11.97 |
| -0.290000000000074 | 0.013 | 1.02 | 11.975 |
| -0.287500000000074 | 0.013 | 1.022 | 11.979 |
| -0.285000000000074 | 0.013 | 1.023 | 11.983 |
| -0.282500000000074 | 0.013 | 1.024 | 11.987 |
| -0.280000000000074 | 0.013 | 1.025 | 11.991 |
| -0.277500000000074 | 0.013 | 1.026 | 11.995 |
| -0.275000000000074 | 0.013 | 1.027 | 11.999 |
| -0.272500000000074 | 0.013 | 1.028 | 12.002 |
| -0.270000000000074 | 0.013 | 1.028 | 12.006 |
| -0.267500000000074 | 0.013 | 1.029 | 12.01 |
| -0.265000000000074 | 0.013 | 1.03 | 12.014 |
| -0.262500000000074 | 0.014 | 1.031 | 12.017 |
| -0.260000000000074 | 0.014 | 1.032 | 12.021 |
| -0.257500000000074 | 0.014 | 1.033 | 12.024 |
| -0.255000000000074 | 0.014 | 1.034 | 12.027 |
| -0.252500000000074 | 0.014 | 1.035 | 12.031 |
| -0.250000000000074 | 0.014 | 1.036 | 12.034 |
| -0.247500000000074 | 0.014 | 1.036 | 12.037 |
| -0.245000000000074 | 0.014 | 1.037 | 12.04 |
| -0.242500000000074 | 0.014 | 1.038 | 12.044 |
| -0.240000000000074 | 0.014 | 1.039 | 12.047 |
| -0.237500000000074 | 0.014 | 1.04 | 12.05 |
| -0.235000000000074 | 0.014 | 1.04 | 12.053 |
| -0.232500000000074 | 0.014 | 1.041 | 12.055 |
| -0.230000000000074 | 0.014 | 1.042 | 12.058 |
| -0.227500000000074 | 0.014 | 1.043 | 12.061 |
| -0.225000000000074 | 0.014 | 1.043 | 12.064 |
| -0.222500000000074 | 0.015 | 1.044 | 12.066 |
| -0.220000000000074 | 0.015 | 1.045 | 12.069 |
| -0.217500000000074 | 0.015 | 1.045 | 12.072 |
| -0.215000000000074 | 0.015 | 1.046 | 12.074 |
| -0.212500000000074 | 0.015 | 1.047 | 12.077 |
| -0.210000000000074 | 0.015 | 1.047 | 12.079 |
| -0.207500000000074 | 0.015 | 1.048 | 12.081 |
| -0.205000000000074 | 0.015 | 1.049 | 12.084 |
| -0.202500000000074 | 0.015 | 1.049 | 12.086 |
| -0.200000000000074 | 0.015 | 1.05 | 12.088 |
| -0.197500000000074 | 0.015 | 1.05 | 12.09 |
| -0.195000000000074 | 0.015 | 1.051 | 12.093 |
| -0.192500000000074 | 0.015 | 1.051 | 12.095 |
| -0.190000000000074 | 0.015 | 1.052 | 12.097 |
| -0.187500000000074 | 0.015 | 1.053 | 12.099 |
| -0.185000000000074 | 0.015 | 1.053 | 12.101 |
| -0.182500000000074 | 0.015 | 1.054 | 12.102 |
| -0.180000000000074 | 0.015 | 1.054 | 12.104 |
| -0.177500000000074 | 0.015 | 1.055 | 12.106 |
| -0.175000000000074 | 0.015 | 1.055 | 12.108 |
| -0.172500000000074 | 0.016 | 1.055 | 12.11 |
| -0.170000000000074 | 0.016 | 1.056 | 12.111 |
| -0.167500000000074 | 0.016 | 1.056 | 12.113 |
| -0.165000000000074 | 0.016 | 1.057 | 12.114 |
| -0.162500000000074 | 0.016 | 1.057 | 12.116 |
| -0.160000000000074 | 0.016 | 1.058 | 12.117 |
| -0.157500000000074 | 0.016 | 1.058 | 12.119 |
| -0.155000000000074 | 0.016 | 1.058 | 12.12 |
| -0.152500000000074 | 0.016 | 1.059 | 12.122 |
| -0.150000000000074 | 0.016 | 1.059 | 12.123 |
| -0.147500000000074 | 0.016 | 1.059 | 12.124 |
| -0.145000000000074 | 0.016 | 1.06 | 12.125 |
| -0.142500000000074 | 0.016 | 1.06 | 12.127 |
| -0.140000000000074 | 0.016 | 1.06 | 12.128 |
| -0.137500000000074 | 0.016 | 1.061 | 12.129 |
| -0.135000000000074 | 0.016 | 1.061 | 12.13 |
| -0.132500000000074 | 0.016 | 1.061 | 12.131 |
| -0.130000000000074 | 0.016 | 1.062 | 12.132 |
| -0.127500000000074 | 0.016 | 1.062 | 12.133 |
| -0.125000000000074 | 0.016 | 1.062 | 12.134 |
| -0.122500000000074 | 0.016 | 1.062 | 12.135 |
| -0.120000000000074 | 0.016 | 1.063 | 12.136 |
| -0.117500000000074 | 0.016 | 1.063 | 12.137 |
| -0.115000000000074 | 0.016 | 1.063 | 12.137 |
| -0.112500000000074 | 0.016 | 1.063 | 12.138 |
| -0.110000000000074 | 0.016 | 1.064 | 12.139 |
| -0.107500000000074 | 0.016 | 1.064 | 12.14 |
| -0.105000000000074 | 0.016 | 1.064 | 12.14 |
| -0.102500000000074 | 0.016 | 1.064 | 12.141 |
| -0.100000000000074 | 0.016 | 1.064 | 12.142 |
| -0.0975000000000742 | 0.016 | 1.064 | 12.142 |
| -0.0950000000000742 | 0.016 | 1.065 | 12.143 |
| -0.0925000000000742 | 0.016 | 1.065 | 12.143 |
| -0.0900000000000742 | 0.016 | 1.065 | 12.144 |
| -0.0875000000000742 | 0.016 | 1.065 | 12.144 |
| -0.0850000000000742 | 0.016 | 1.065 | 12.145 |
| -0.0825000000000742 | 0.017 | 1.065 | 12.145 |
| -0.0800000000000742 | 0.017 | 1.065 | 12.146 |
| -0.0775000000000742 | 0.017 | 1.066 | 12.146 |
| -0.0750000000000742 | 0.017 | 1.066 | 12.146 |
| -0.0725000000000742 | 0.017 | 1.066 | 12.147 |
| -0.0700000000000742 | 0.017 | 1.066 | 12.147 |
| -0.0675000000000742 | 0.017 | 1.066 | 12.147 |
| -0.0650000000000742 | 0.017 | 1.066 | 12.148 |
| -0.0625000000000742 | 0.017 | 1.066 | 12.148 |
| -0.0600000000000742 | 0.017 | 1.066 | 12.148 |
| -0.0575000000000742 | 0.017 | 1.066 | 12.148 |
| -0.0550000000000742 | 0.017 | 1.066 | 12.149 |
| -0.0525000000000742 | 0.017 | 1.066 | 12.149 |
| -0.0500000000000742 | 0.017 | 1.066 | 12.149 |
| -0.0475000000000742 | 0.017 | 1.066 | 12.149 |
| -0.0450000000000742 | 0.017 | 1.066 | 12.149 |
| -0.0425000000000742 | 0.017 | 1.066 | 12.149 |
| -0.0400000000000742 | 0.017 | 1.067 | 12.149 |
| -0.0375000000000742 | 0.017 | 1.067 | 12.15 |
| -0.0350000000000742 | 0.017 | 1.067 | 12.15 |
| -0.0325000000000742 | 0.017 | 1.067 | 12.15 |
| -0.0300000000000742 | 0.017 | 1.067 | 12.15 |
| -0.0275000000000742 | 0.017 | 1.067 | 12.15 |
| -0.0250000000000742 | 0.017 | 1.067 | 12.15 |
| -0.0225000000000742 | 0.017 | 1.067 | 12.15 |
| -0.0200000000000742 | 0.017 | 1.067 | 12.15 |
| -0.0175000000000742 | 0.017 | 1.067 | 12.15 |
| -0.0150000000000742 | 0.017 | 1.067 | 12.15 |
| -0.0125000000000742 | 0.017 | 1.067 | 12.15 |
| -0.0100000000000742 | 0.017 | 1.067 | 12.15 |
| -0.0075000000000742 | 0.017 | 1.067 | 12.15 |
| -0.0050000000000742 | 0.017 | 1.067 | 12.15 |
| -0.0025000000000742 | 0.017 | 1.067 | 12.15 |
| -7.4196725152742e-14 | 0.017 | 1.067 | 12.15 |
| 0.0024999999999258 | 0.017 | 1.067 | 12.15 |
| 0.0049999999999258 | 0.017 | 1.067 | 12.15 |
| 0.0074999999999258 | 0.017 | 1.067 | 12.15 |
| 0.0099999999999258 | 0.017 | 1.067 | 12.15 |
| 0.0124999999999258 | 0.017 | 1.067 | 12.15 |
| 0.0149999999999258 | 0.017 | 1.067 | 12.15 |
| 0.0174999999999258 | 0.017 | 1.067 | 12.15 |
| 0.0199999999999258 | 0.017 | 1.067 | 12.15 |
| 0.0224999999999258 | 0.017 | 1.067 | 12.15 |
| 0.0249999999999258 | 0.017 | 1.067 | 12.15 |
| 0.0274999999999258 | 0.017 | 1.067 | 12.15 |
| 0.0299999999999258 | 0.017 | 1.067 | 12.15 |
| 0.0324999999999258 | 0.017 | 1.067 | 12.15 |
| 0.0349999999999258 | 0.017 | 1.067 | 12.15 |
| 0.0374999999999258 | 0.017 | 1.067 | 12.15 |
| 0.0399999999999258 | 0.017 | 1.067 | 12.151 |
| 0.0424999999999258 | 0.017 | 1.067 | 12.151 |
| 0.0449999999999258 | 0.017 | 1.067 | 12.151 |
| 0.0474999999999258 | 0.017 | 1.067 | 12.151 |
| 0.0499999999999258 | 0.017 | 1.067 | 12.151 |
| 0.0524999999999258 | 0.017 | 1.067 | 12.151 |
| 0.0549999999999258 | 0.017 | 1.067 | 12.152 |
| 0.0574999999999258 | 0.017 | 1.067 | 12.152 |
| 0.0599999999999258 | 0.017 | 1.067 | 12.152 |
| 0.0624999999999258 | 0.017 | 1.067 | 12.152 |
| 0.0649999999999258 | 0.017 | 1.067 | 12.153 |
| 0.0674999999999258 | 0.017 | 1.068 | 12.153 |
| 0.0699999999999258 | 0.017 | 1.068 | 12.153 |
| 0.0724999999999258 | 0.017 | 1.068 | 12.154 |
| 0.0749999999999258 | 0.017 | 1.068 | 12.154 |
| 0.0774999999999258 | 0.017 | 1.068 | 12.154 |
| 0.0799999999999258 | 0.017 | 1.068 | 12.155 |
| 0.0824999999999258 | 0.017 | 1.068 | 12.155 |
| 0.0849999999999258 | 0.017 | 1.068 | 12.156 |
| 0.0874999999999258 | 0.017 | 1.069 | 12.156 |
| 0.0899999999999258 | 0.017 | 1.069 | 12.157 |
| 0.0924999999999258 | 0.017 | 1.069 | 12.158 |
| 0.0949999999999258 | 0.017 | 1.069 | 12.158 |
| 0.0974999999999258 | 0.017 | 1.069 | 12.159 |
| 0.0999999999999258 | 0.017 | 1.07 | 12.16 |
| 0.102499999999926 | 0.017 | 1.07 | 12.16 |
| 0.104999999999926 | 0.017 | 1.07 | 12.161 |
| 0.107499999999926 | 0.017 | 1.07 | 12.162 |
| 0.109999999999926 | 0.017 | 1.071 | 12.163 |
| 0.112499999999926 | 0.017 | 1.071 | 12.164 |
| 0.114999999999926 | 0.017 | 1.071 | 12.165 |
| 0.117499999999926 | 0.017 | 1.072 | 12.166 |
| 0.119999999999926 | 0.017 | 1.072 | 12.167 |
| 0.122499999999926 | 0.017 | 1.072 | 12.168 |
| 0.124999999999926 | 0.018 | 1.073 | 12.169 |
| 0.127499999999926 | 0.018 | 1.073 | 12.17 |
| 0.129999999999926 | 0.018 | 1.073 | 12.172 |
| 0.132499999999926 | 0.018 | 1.074 | 12.173 |
| 0.134999999999926 | 0.018 | 1.074 | 12.174 |
| 0.137499999999926 | 0.018 | 1.075 | 12.176 |
| 0.139999999999926 | 0.018 | 1.075 | 12.177 |
| 0.142499999999926 | 0.018 | 1.076 | 12.179 |
| 0.144999999999926 | 0.018 | 1.076 | 12.181 |
| 0.147499999999926 | 0.018 | 1.077 | 12.182 |
| 0.149999999999926 | 0.018 | 1.077 | 12.184 |
| 0.152499999999926 | 0.018 | 1.078 | 12.186 |
| 0.154999999999926 | 0.018 | 1.078 | 12.188 |
| 0.157499999999926 | 0.018 | 1.079 | 12.189 |
| 0.159999999999926 | 0.019 | 1.08 | 12.191 |
| 0.162499999999926 | 0.019 | 1.08 | 12.194 |
| 0.164999999999926 | 0.019 | 1.081 | 12.196 |
| 0.167499999999926 | 0.019 | 1.082 | 12.198 |
| 0.169999999999926 | 0.019 | 1.082 | 12.2 |
| 0.172499999999926 | 0.019 | 1.083 | 12.202 |
| 0.174999999999926 | 0.019 | 1.084 | 12.205 |
| 0.177499999999926 | 0.019 | 1.085 | 12.207 |
| 0.179999999999926 | 0.02 | 1.086 | 12.21 |
| 0.182499999999926 | 0.02 | 1.086 | 12.213 |
| 0.184999999999926 | 0.02 | 1.087 | 12.215 |
| 0.187499999999926 | 0.02 | 1.088 | 12.218 |
| 0.189999999999926 | 0.02 | 1.089 | 12.221 |
| 0.192499999999926 | 0.02 | 1.09 | 12.224 |
| 0.194999999999926 | 0.02 | 1.091 | 12.227 |
| 0.197499999999926 | 0.021 | 1.092 | 12.23 |
| 0.199999999999926 | 0.021 | 1.093 | 12.233 |
| 0.202499999999926 | 0.021 | 1.094 | 12.237 |
| 0.204999999999926 | 0.021 | 1.095 | 12.24 |
| 0.207499999999926 | 0.021 | 1.097 | 12.244 |
| 0.209999999999926 | 0.021 | 1.098 | 12.247 |
| 0.212499999999926 | 0.022 | 1.099 | 12.251 |
| 0.214999999999926 | 0.022 | 1.1 | 12.255 |
| 0.217499999999926 | 0.022 | 1.101 | 12.259 |
| 0.219999999999926 | 0.022 | 1.103 | 12.263 |
| 0.222499999999926 | 0.023 | 1.104 | 12.267 |
| 0.224999999999926 | 0.023 | 1.105 | 12.271 |
| 0.227499999999926 | 0.023 | 1.107 | 12.275 |
| 0.229999999999926 | 0.023 | 1.108 | 12.28 |
| 0.232499999999926 | 0.023 | 1.11 | 12.284 |
| 0.234999999999926 | 0.024 | 1.111 | 12.289 |
| 0.237499999999926 | 0.024 | 1.113 | 12.293 |
| 0.239999999999926 | 0.024 | 1.114 | 12.298 |
| 0.242499999999926 | 0.025 | 1.116 | 12.303 |
| 0.244999999999926 | 0.025 | 1.118 | 12.308 |
| 0.247499999999926 | 0.025 | 1.12 | 12.313 |
| 0.249999999999926 | 0.025 | 1.121 | 12.319 |
| 0.252499999999926 | 0.026 | 1.123 | 12.324 |
| 0.254999999999926 | 0.026 | 1.125 | 12.33 |
| 0.257499999999926 | 0.026 | 1.127 | 12.335 |
| 0.259999999999926 | 0.027 | 1.129 | 12.341 |
| 0.262499999999926 | 0.027 | 1.131 | 12.347 |
| 0.264999999999926 | 0.027 | 1.133 | 12.353 |
| 0.267499999999926 | 0.028 | 1.135 | 12.359 |
| 0.269999999999926 | 0.028 | 1.137 | 12.366 |
| 0.272499999999926 | 0.029 | 1.139 | 12.372 |
| 0.274999999999926 | 0.029 | 1.141 | 12.379 |
| 0.277499999999926 | 0.029 | 1.143 | 12.385 |
| 0.279999999999926 | 0.03 | 1.146 | 12.392 |
| 0.282499999999926 | 0.03 | 1.148 | 12.399 |
| 0.284999999999926 | 0.031 | 1.151 | 12.406 |
| 0.287499999999926 | 0.031 | 1.153 | 12.414 |
| 0.289999999999926 | 0.031 | 1.155 | 12.421 |
| 0.292499999999926 | 0.032 | 1.158 | 12.429 |
| 0.294999999999926 | 0.032 | 1.161 | 12.436 |
| 0.297499999999926 | 0.033 | 1.163 | 12.444 |
| 0.299999999999926 | 0.033 | 1.166 | 12.452 |
| 0.302499999999926 | 0.034 | 1.169 | 12.46 |
| 0.304999999999926 | 0.034 | 1.172 | 12.469 |
| 0.307499999999926 | 0.035 | 1.174 | 12.477 |
| 0.309999999999926 | 0.035 | 1.177 | 12.486 |
| 0.312499999999926 | 0.036 | 1.18 | 12.495 |
| 0.314999999999926 | 0.036 | 1.183 | 12.504 |
| 0.317499999999926 | 0.037 | 1.187 | 12.513 |
| 0.319999999999926 | 0.038 | 1.19 | 12.522 |
| 0.322499999999926 | 0.038 | 1.193 | 12.531 |
| 0.324999999999926 | 0.039 | 1.196 | 12.541 |
| 0.327499999999926 | 0.039 | 1.2 | 12.551 |
| 0.329999999999926 | 0.04 | 1.203 | 12.561 |
| 0.332499999999926 | 0.041 | 1.206 | 12.571 |
| 0.334999999999926 | 0.041 | 1.21 | 12.581 |
| 0.337499999999926 | 0.042 | 1.214 | 12.592 |
| 0.339999999999926 | 0.043 | 1.217 | 12.602 |
| 0.342499999999926 | 0.043 | 1.221 | 12.613 |
| 0.344999999999926 | 0.044 | 1.225 | 12.624 |
| 0.347499999999926 | 0.045 | 1.229 | 12.636 |
| 0.349999999999926 | 0.046 | 1.233 | 12.647 |
| 0.352499999999926 | 0.046 | 1.237 | 12.659 |
| 0.354999999999926 | 0.047 | 1.241 | 12.67 |
| 0.357499999999926 | 0.048 | 1.245 | 12.682 |
| 0.359999999999926 | 0.049 | 1.249 | 12.695 |
| 0.362499999999926 | 0.05 | 1.253 | 12.707 |
| 0.364999999999926 | 0.05 | 1.258 | 12.72 |
| 0.367499999999926 | 0.051 | 1.262 | 12.732 |
| 0.369999999999926 | 0.052 | 1.267 | 12.745 |
| 0.372499999999926 | 0.053 | 1.271 | 12.758 |
| 0.374999999999926 | 0.054 | 1.276 | 12.772 |
| 0.377499999999926 | 0.055 | 1.281 | 12.786 |
| 0.379999999999926 | 0.056 | 1.286 | 12.799 |
| 0.382499999999926 | 0.057 | 1.29 | 12.813 |
| 0.384999999999926 | 0.058 | 1.295 | 12.828 |
| 0.387499999999926 | 0.059 | 1.301 | 12.842 |
| 0.389999999999926 | 0.06 | 1.306 | 12.857 |
| 0.392499999999926 | 0.061 | 1.311 | 12.872 |
| 0.394999999999926 | 0.062 | 1.316 | 12.887 |
| 0.397499999999926 | 0.063 | 1.322 | 12.902 |
| 0.399999999999926 | 0.064 | 1.327 | 12.918 |
| 0.402499999999926 | 0.065 | 1.333 | 12.934 |
| 0.404999999999926 | 0.066 | 1.338 | 12.95 |
| 0.407499999999926 | 0.067 | 1.344 | 12.966 |
| 0.409999999999926 | 0.069 | 1.35 | 12.983 |
| 0.412499999999926 | 0.07 | 1.356 | 12.999 |
| 0.414999999999926 | 0.071 | 1.362 | 13.016 |
| 0.417499999999926 | 0.072 | 1.368 | 13.034 |
| 0.419999999999926 | 0.073 | 1.374 | 13.051 |
| 0.422499999999926 | 0.075 | 1.38 | 13.069 |
| 0.424999999999926 | 0.076 | 1.387 | 13.087 |
| 0.427499999999926 | 0.077 | 1.393 | 13.105 |
| 0.429999999999926 | 0.079 | 1.4 | 13.124 |
| 0.432499999999926 | 0.08 | 1.407 | 13.143 |
| 0.434999999999926 | 0.081 | 1.413 | 13.162 |
| 0.437499999999926 | 0.083 | 1.42 | 13.181 |
| 0.439999999999926 | 0.084 | 1.427 | 13.201 |
| 0.442499999999926 | 0.086 | 1.434 | 13.22 |
| 0.444999999999926 | 0.087 | 1.442 | 13.24 |
| 0.447499999999926 | 0.089 | 1.449 | 13.261 |
| 0.449999999999926 | 0.09 | 1.456 | 13.282 |
| 0.452499999999926 | 0.092 | 1.464 | 13.302 |
| 0.454999999999926 | 0.093 | 1.471 | 13.324 |
| 0.457499999999926 | 0.095 | 1.479 | 13.345 |
| 0.459999999999926 | 0.097 | 1.487 | 13.367 |
| 0.462499999999926 | 0.098 | 1.495 | 13.389 |
| 0.464999999999926 | 0.1 | 1.503 | 13.411 |
| 0.467499999999926 | 0.102 | 1.511 | 13.434 |
| 0.469999999999926 | 0.103 | 1.519 | 13.457 |
| 0.472499999999926 | 0.105 | 1.528 | 13.48 |
| 0.474999999999926 | 0.107 | 1.536 | 13.504 |
| 0.477499999999926 | 0.109 | 1.545 | 13.527 |
| 0.479999999999926 | 0.111 | 1.553 | 13.552 |
| 0.482499999999926 | 0.113 | 1.562 | 13.576 |
| 0.484999999999926 | 0.114 | 1.571 | 13.601 |
| 0.487499999999926 | 0.116 | 1.58 | 13.626 |
| 0.489999999999926 | 0.118 | 1.59 | 13.651 |
| 0.492499999999926 | 0.12 | 1.599 | 13.677 |
| 0.494999999999926 | 0.122 | 1.608 | 13.703 |
| 0.497499999999926 | 0.124 | 1.618 | 13.729 |
| 0.499999999999926 | 0.127 | 1.628 | 13.756 |
| 0.502499999999926 | 0.129 | 1.637 | 13.783 |
| 0.504999999999926 | 0.131 | 1.647 | 13.81 |
| 0.507499999999926 | 0.133 | 1.657 | 13.838 |
| 0.509999999999926 | 0.135 | 1.668 | 13.866 |
| 0.512499999999926 | 0.138 | 1.678 | 13.894 |
| 0.514999999999926 | 0.14 | 1.689 | 13.922 |
| 0.517499999999926 | 0.142 | 1.699 | 13.951 |
| 0.519999999999926 | 0.144 | 1.71 | 13.981 |
| 0.522499999999926 | 0.147 | 1.721 | 14.01 |
| 0.524999999999926 | 0.149 | 1.732 | 14.04 |
| 0.527499999999926 | 0.152 | 1.743 | 14.071 |
| 0.529999999999926 | 0.154 | 1.754 | 14.101 |
| 0.532499999999925 | 0.157 | 1.766 | 14.133 |
| 0.534999999999925 | 0.159 | 1.777 | 14.164 |
| 0.537499999999925 | 0.162 | 1.789 | 14.196 |
| 0.539999999999925 | 0.165 | 1.801 | 14.228 |
| 0.542499999999925 | 0.167 | 1.813 | 14.26 |
| 0.544999999999925 | 0.17 | 1.825 | 14.293 |
| 0.547499999999925 | 0.173 | 1.837 | 14.327 |
| 0.549999999999925 | 0.176 | 1.85 | 14.36 |
| 0.552499999999925 | 0.178 | 1.862 | 14.394 |
| 0.554999999999925 | 0.181 | 1.875 | 14.429 |
| 0.557499999999925 | 0.184 | 1.888 | 14.463 |
| 0.559999999999925 | 0.187 | 1.901 | 14.499 |
| 0.562499999999925 | 0.19 | 1.914 | 14.534 |
| 0.564999999999925 | 0.193 | 1.928 | 14.57 |
| 0.567499999999925 | 0.196 | 1.941 | 14.607 |
| 0.569999999999925 | 0.199 | 1.955 | 14.643 |
| 0.572499999999925 | 0.203 | 1.969 | 14.68 |
| 0.574999999999925 | 0.206 | 1.983 | 14.718 |
| 0.577499999999925 | 0.209 | 1.997 | 14.756 |
| 0.579999999999924 | 0.212 | 2.012 | 14.794 |
| 0.582499999999924 | 0.216 | 2.026 | 14.833 |
| 0.584999999999924 | 0.219 | 2.041 | 14.872 |
| 0.587499999999924 | 0.222 | 2.056 | 14.912 |
| 0.589999999999924 | 0.226 | 2.071 | 14.952 |
| 0.592499999999924 | 0.229 | 2.086 | 14.993 |
| 0.594999999999924 | 0.233 | 2.101 | 15.033 |
| 0.597499999999924 | 0.237 | 2.117 | 15.075 |
| 0.599999999999924 | 0.24 | 2.133 | 15.117 |
| 0.602499999999924 | 0.244 | 2.148 | 15.159 |
| 0.604999999999924 | 0.248 | 2.165 | 15.201 |
| 0.607499999999924 | 0.252 | 2.181 | 15.244 |
| 0.609999999999924 | 0.255 | 2.197 | 15.288 |
| 0.612499999999924 | 0.259 | 2.214 | 15.332 |
| 0.614999999999924 | 0.263 | 2.231 | 15.376 |
| 0.617499999999924 | 0.267 | 2.248 | 15.421 |
| 0.619999999999924 | 0.271 | 2.265 | 15.467 |
| 0.622499999999923 | 0.275 | 2.282 | 15.513 |
| 0.624999999999923 | 0.28 | 2.3 | 15.559 |
| 0.627499999999923 | 0.284 | 2.318 | 15.606 |
| 0.629999999999923 | 0.288 | 2.336 | 15.653 |
| 0.632499999999923 | 0.292 | 2.354 | 15.701 |
| 0.634999999999923 | 0.297 | 2.372 | 15.749 |
| 0.637499999999923 | 0.301 | 2.391 | 15.797 |
| 0.639999999999923 | 0.306 | 2.409 | 15.846 |
| 0.642499999999923 | 0.31 | 2.428 | 15.896 |
| 0.644999999999923 | 0.315 | 2.447 | 15.946 |
| 0.647499999999923 | 0.32 | 2.467 | 15.997 |
| 0.649999999999923 | 0.324 | 2.486 | 16.048 |
| 0.652499999999923 | 0.329 | 2.506 | 16.1 |
| 0.654999999999923 | 0.334 | 2.526 | 16.152 |
| 0.657499999999923 | 0.339 | 2.546 | 16.204 |
| 0.659999999999923 | 0.344 | 2.567 | 16.257 |
| 0.662499999999923 | 0.349 | 2.587 | 16.311 |
| 0.664999999999923 | 0.354 | 2.608 | 16.365 |
| 0.667499999999922 | 0.359 | 2.629 | 16.42 |
| 0.669999999999922 | 0.364 | 2.65 | 16.475 |
| 0.672499999999922 | 0.369 | 2.672 | 16.531 |
| 0.674999999999922 | 0.375 | 2.693 | 16.587 |
| 0.677499999999922 | 0.38 | 2.715 | 16.644 |
| 0.679999999999922 | 0.386 | 2.738 | 16.701 |
| 0.682499999999922 | 0.391 | 2.76 | 16.759 |
| 0.684999999999922 | 0.397 | 2.783 | 16.818 |
| 0.687499999999922 | 0.402 | 2.805 | 16.877 |
| 0.689999999999922 | 0.408 | 2.828 | 16.936 |
| 0.692499999999922 | 0.414 | 2.852 | 16.996 |
| 0.694999999999922 | 0.42 | 2.875 | 17.057 |
| 0.697499999999922 | 0.426 | 2.899 | 17.118 |
| 0.699999999999922 | 0.432 | 2.923 | 17.18 |
| 0.702499999999922 | 0.438 | 2.947 | 17.242 |
| 0.704999999999922 | 0.444 | 2.972 | 17.305 |
| 0.707499999999922 | 0.45 | 2.996 | 17.369 |
| 0.709999999999922 | 0.456 | 3.021 | 17.433 |
| 0.712499999999922 | 0.462 | 3.047 | 17.497 |
| 0.714999999999922 | 0.469 | 3.072 | 17.562 |
| 0.717499999999921 | 0.475 | 3.098 | 17.628 |
| 0.719999999999921 | 0.482 | 3.124 | 17.695 |
| 0.722499999999921 | 0.489 | 3.15 | 17.762 |
| 0.724999999999921 | 0.495 | 3.176 | 17.829 |
| 0.727499999999921 | 0.502 | 3.203 | 17.898 |
| 0.729999999999921 | 0.509 | 3.23 | 17.966 |
| 0.732499999999921 | 0.516 | 3.257 | 18.036 |
| 0.734999999999921 | 0.523 | 3.285 | 18.106 |
| 0.737499999999921 | 0.53 | 3.312 | 18.177 |
| 0.739999999999921 | 0.537 | 3.341 | 18.248 |
| 0.742499999999921 | 0.544 | 3.369 | 18.32 |
| 0.744999999999921 | 0.552 | 3.397 | 18.392 |
| 0.747499999999921 | 0.559 | 3.426 | 18.466 |
| 0.749999999999921 | 0.567 | 3.455 | 18.539 |
| 0.752499999999921 | 0.574 | 3.485 | 18.614 |
| 0.754999999999921 | 0.582 | 3.514 | 18.689 |
| 0.757499999999921 | 0.59 | 3.544 | 18.765 |
| 0.759999999999921 | 0.597 | 3.575 | 18.841 |
| 0.76249999999992 | 0.605 | 3.605 | 18.918 |
| 0.76499999999992 | 0.613 | 3.636 | 18.996 |
| 0.76749999999992 | 0.621 | 3.667 | 19.074 |
| 0.76999999999992 | 0.63 | 3.698 | 19.154 |
| 0.77249999999992 | 0.638 | 3.73 | 19.233 |
| 0.77499999999992 | 0.646 | 3.762 | 19.314 |
| 0.77749999999992 | 0.655 | 3.794 | 19.395 |
| 0.77999999999992 | 0.663 | 3.827 | 19.477 |
| 0.78249999999992 | 0.672 | 3.859 | 19.559 |
| 0.78499999999992 | 0.681 | 3.893 | 19.642 |
| 0.78749999999992 | 0.689 | 3.926 | 19.726 |
| 0.78999999999992 | 0.698 | 3.96 | 19.811 |
| 0.79249999999992 | 0.707 | 3.994 | 19.896 |
| 0.79499999999992 | 0.716 | 4.028 | 19.982 |
| 0.79749999999992 | 0.726 | 4.063 | 20.069 |
| 0.79999999999992 | 0.735 | 4.098 | 20.156 |
| 0.80249999999992 | 0.744 | 4.133 | 20.244 |
| 0.80499999999992 | 0.754 | 4.169 | 20.333 |
| 0.80749999999992 | 0.763 | 4.204 | 20.423 |
| 0.80999999999992 | 0.773 | 4.241 | 20.513 |
| 0.812499999999919 | 0.783 | 4.277 | 20.604 |
| 0.814999999999919 | 0.793 | 4.314 | 20.696 |
| 0.817499999999919 | 0.803 | 4.351 | 20.789 |
| 0.819999999999919 | 0.813 | 4.389 | 20.882 |
| 0.822499999999919 | 0.823 | 4.427 | 20.976 |
| 0.824999999999919 | 0.833 | 4.465 | 21.071 |
| 0.827499999999919 | 0.844 | 4.503 | 21.167 |
| 0.829999999999919 | 0.854 | 4.542 | 21.263 |
| 0.832499999999919 | 0.865 | 4.582 | 21.36 |
| 0.834999999999919 | 0.875 | 4.621 | 21.458 |
| 0.837499999999919 | 0.886 | 4.661 | 21.557 |
| 0.839999999999919 | 0.897 | 4.701 | 21.656 |
| 0.842499999999919 | 0.908 | 4.742 | 21.757 |
| 0.844999999999919 | 0.919 | 4.783 | 21.858 |
| 0.847499999999919 | 0.931 | 4.824 | 21.96 |
| 0.849999999999919 | 0.942 | 4.866 | 22.062 |
| 0.852499999999919 | 0.953 | 4.908 | 22.166 |
| 0.854999999999919 | 0.965 | 4.95 | 22.27 |
| 0.857499999999918 | 0.977 | 4.993 | 22.375 |
| 0.859999999999918 | 0.989 | 5.036 | 22.481 |
| 0.862499999999918 | 1.001 | 5.079 | 22.588 |
| 0.864999999999918 | 1.013 | 5.123 | 22.695 |
| 0.867499999999918 | 1.025 | 5.167 | 22.804 |
| 0.869999999999918 | 1.037 | 5.212 | 22.913 |
| 0.872499999999918 | 1.05 | 5.257 | 23.023 |
| 0.874999999999918 | 1.062 | 5.302 | 23.134 |
| 0.877499999999918 | 1.075 | 5.348 | 23.246 |
| 0.879999999999918 | 1.088 | 5.394 | 23.359 |
| 0.882499999999918 | 1.101 | 5.44 | 23.472 |
| 0.884999999999918 | 1.114 | 5.487 | 23.586 |
| 0.887499999999918 | 1.127 | 5.534 | 23.702 |
| 0.889999999999918 | 1.14 | 5.582 | 23.818 |
| 0.892499999999918 | 1.154 | 5.63 | 23.935 |
| 0.894999999999918 | 1.167 | 5.678 | 24.053 |
| 0.897499999999918 | 1.181 | 5.727 | 24.171 |
| 0.899999999999918 | 1.195 | 5.776 | 24.291 |
| 0.902499999999918 | 1.209 | 5.826 | 24.412 |
| 0.904999999999918 | 1.223 | 5.876 | 24.533 |
| 0.907499999999917 | 1.237 | 5.926 | 24.656 |
| 0.909999999999917 | 1.251 | 5.977 | 24.779 |
| 0.912499999999917 | 1.266 | 6.028 | 24.903 |
| 0.914999999999917 | 1.28 | 6.08 | 25.028 |
| 0.917499999999917 | 1.295 | 6.132 | 25.154 |
| 0.919999999999917 | 1.31 | 6.184 | 25.281 |
| 0.922499999999917 | 1.325 | 6.237 | 25.409 |
| 0.924999999999917 | 1.34 | 6.291 | 25.538 |
| 0.927499999999917 | 1.356 | 6.344 | 25.668 |
| 0.929999999999917 | 1.371 | 6.398 | 25.799 |
| 0.932499999999917 | 1.387 | 6.453 | 25.93 |
| 0.934999999999917 | 1.402 | 6.508 | 26.063 |
| 0.937499999999917 | 1.418 | 6.564 | 26.197 |
| 0.939999999999917 | 1.434 | 6.619 | 26.331 |
| 0.942499999999917 | 1.451 | 6.676 | 26.467 |
| 0.944999999999917 | 1.467 | 6.733 | 26.603 |
| 0.947499999999917 | 1.483 | 6.79 | 26.741 |
| 0.949999999999917 | 1.5 | 6.848 | 26.88 |
| 0.952499999999916 | 1.517 | 6.906 | 27.019 |
| 0.954999999999916 | 1.534 | 6.964 | 27.16 |
| 0.957499999999916 | 1.551 | 7.023 | 27.301 |
| 0.959999999999916 | 1.568 | 7.083 | 27.444 |
| 0.962499999999916 | 1.586 | 7.143 | 27.587 |
| 0.964999999999916 | 1.603 | 7.203 | 27.732 |
| 0.967499999999916 | 1.621 | 7.264 | 27.878 |
| 0.969999999999916 | 1.639 | 7.326 | 28.024 |
| 0.972499999999916 | 1.657 | 7.388 | 28.172 |
| 0.974999999999916 | 1.675 | 7.45 | 28.321 |
| 0.977499999999916 | 1.694 | 7.513 | 28.471 |
| 0.979999999999916 | 1.712 | 7.576 | 28.621 |
| 0.982499999999916 | 1.731 | 7.64 | 28.773 |
| 0.984999999999916 | 1.75 | 7.704 | 28.926 |
| 0.987499999999916 | 1.769 | 7.769 | 29.08 |
| 0.989999999999916 | 1.788 | 7.834 | 29.235 |
| 0.992499999999916 | 1.807 | 7.9 | 29.392 |
| 0.994999999999916 | 1.827 | 7.966 | 29.549 |
| 0.997499999999916 | 1.847 | 8.033 | 29.707 |
| 0.999999999999915 | 1.867 | 8.1 | 29.867 |